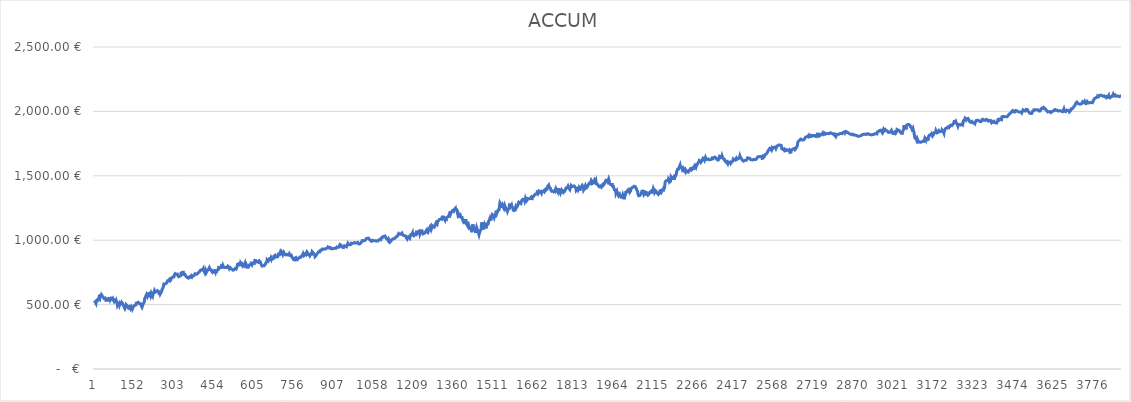
| Category | ACCUM |
|---|---|
| 0 | 512.623 |
| 1 | 507.414 |
| 2 | 518.309 |
| 3 | 517.795 |
| 4 | 521.968 |
| 5 | 520.018 |
| 6 | 518.518 |
| 7 | 510.027 |
| 8 | 525.175 |
| 9 | 525.111 |
| 10 | 529.126 |
| 11 | 526.892 |
| 12 | 528.816 |
| 13 | 539.458 |
| 14 | 543.008 |
| 15 | 540.229 |
| 16 | 535.636 |
| 17 | 545.15 |
| 18 | 553.718 |
| 19 | 550.766 |
| 20 | 550.173 |
| 21 | 544.728 |
| 22 | 558.929 |
| 23 | 569.485 |
| 24 | 567.345 |
| 25 | 564.527 |
| 26 | 570.089 |
| 27 | 568.044 |
| 28 | 575.996 |
| 29 | 578.267 |
| 30 | 574.96 |
| 31 | 567.061 |
| 32 | 567.061 |
| 33 | 558.145 |
| 34 | 558.145 |
| 35 | 556.226 |
| 36 | 558.119 |
| 37 | 548.35 |
| 38 | 547.646 |
| 39 | 554.257 |
| 40 | 550.28 |
| 41 | 551.643 |
| 42 | 548.171 |
| 43 | 548.067 |
| 44 | 535.537 |
| 45 | 535.898 |
| 46 | 538.533 |
| 47 | 534.886 |
| 48 | 541.489 |
| 49 | 540.502 |
| 50 | 533.486 |
| 51 | 535.482 |
| 52 | 535.482 |
| 53 | 541.248 |
| 54 | 534.462 |
| 55 | 535.218 |
| 56 | 547.186 |
| 57 | 546.317 |
| 58 | 549.156 |
| 59 | 548.011 |
| 60 | 545.422 |
| 61 | 536.616 |
| 62 | 544.181 |
| 63 | 542.673 |
| 64 | 548.645 |
| 65 | 546.04 |
| 66 | 541.968 |
| 67 | 545.493 |
| 68 | 540.734 |
| 69 | 545.941 |
| 70 | 545.781 |
| 71 | 549.038 |
| 72 | 544.098 |
| 73 | 544.555 |
| 74 | 536.411 |
| 75 | 536.749 |
| 76 | 535.446 |
| 77 | 520.162 |
| 78 | 523.254 |
| 79 | 524.823 |
| 80 | 523.496 |
| 81 | 526.225 |
| 82 | 526.185 |
| 83 | 534.342 |
| 84 | 532.463 |
| 85 | 520.161 |
| 86 | 516.949 |
| 87 | 509.176 |
| 88 | 496.117 |
| 89 | 493.244 |
| 90 | 505.654 |
| 91 | 506.544 |
| 92 | 506.677 |
| 93 | 513.375 |
| 94 | 513.215 |
| 95 | 504.811 |
| 96 | 496.115 |
| 97 | 497.984 |
| 98 | 507.861 |
| 99 | 505.895 |
| 100 | 504.679 |
| 101 | 508.891 |
| 102 | 508.74 |
| 103 | 506.696 |
| 104 | 518.08 |
| 105 | 513.447 |
| 106 | 518.109 |
| 107 | 516.238 |
| 108 | 507.534 |
| 109 | 495.904 |
| 110 | 491.737 |
| 111 | 495.483 |
| 112 | 490.669 |
| 113 | 486.4 |
| 114 | 478.122 |
| 115 | 476.353 |
| 116 | 469.291 |
| 117 | 472.88 |
| 118 | 480.626 |
| 119 | 486.243 |
| 120 | 488.917 |
| 121 | 499.859 |
| 122 | 500.3 |
| 123 | 499.699 |
| 124 | 497.157 |
| 125 | 491.176 |
| 126 | 490.362 |
| 127 | 487.355 |
| 128 | 484.426 |
| 129 | 474.736 |
| 130 | 471.895 |
| 131 | 476.178 |
| 132 | 474.141 |
| 133 | 482.898 |
| 134 | 480.869 |
| 135 | 484.008 |
| 136 | 475.533 |
| 137 | 467.674 |
| 138 | 464.256 |
| 139 | 464.096 |
| 140 | 481.54 |
| 141 | 473.98 |
| 142 | 473.98 |
| 143 | 474.019 |
| 144 | 462.94 |
| 145 | 461.432 |
| 146 | 473.092 |
| 147 | 475.624 |
| 148 | 482.25 |
| 149 | 482.77 |
| 150 | 490.43 |
| 151 | 490.27 |
| 152 | 488.257 |
| 153 | 494.718 |
| 154 | 494.558 |
| 155 | 497.397 |
| 156 | 493.924 |
| 157 | 494.05 |
| 158 | 498.175 |
| 159 | 511.855 |
| 160 | 512.88 |
| 161 | 519.159 |
| 162 | 517.959 |
| 163 | 514.005 |
| 164 | 514.548 |
| 165 | 514.223 |
| 166 | 518.144 |
| 167 | 517.574 |
| 168 | 515.625 |
| 169 | 515.625 |
| 170 | 511.031 |
| 171 | 507.638 |
| 172 | 507.478 |
| 173 | 504.352 |
| 174 | 511.46 |
| 175 | 507.356 |
| 176 | 507.196 |
| 177 | 496.504 |
| 178 | 500.259 |
| 179 | 491.855 |
| 180 | 489.873 |
| 181 | 479.749 |
| 182 | 485.066 |
| 183 | 485.066 |
| 184 | 486.501 |
| 185 | 504.465 |
| 186 | 509.427 |
| 187 | 509.267 |
| 188 | 509.107 |
| 189 | 518.187 |
| 190 | 532.435 |
| 191 | 546.352 |
| 192 | 551.156 |
| 193 | 556.481 |
| 194 | 556.321 |
| 195 | 565.306 |
| 196 | 565.889 |
| 197 | 566.685 |
| 198 | 578.795 |
| 199 | 571.685 |
| 200 | 569.435 |
| 201 | 582.082 |
| 202 | 584.061 |
| 203 | 578.016 |
| 204 | 579.854 |
| 205 | 585.241 |
| 206 | 572.963 |
| 207 | 570.974 |
| 208 | 556.747 |
| 209 | 554.498 |
| 210 | 564.383 |
| 211 | 578.891 |
| 212 | 583.671 |
| 213 | 587.742 |
| 214 | 585.35 |
| 215 | 566.231 |
| 216 | 567.122 |
| 217 | 567.002 |
| 218 | 579.996 |
| 219 | 581.147 |
| 220 | 574.913 |
| 221 | 566.777 |
| 222 | 576.828 |
| 223 | 587.289 |
| 224 | 592.834 |
| 225 | 592.674 |
| 226 | 589.494 |
| 227 | 601.43 |
| 228 | 609.303 |
| 229 | 613.318 |
| 230 | 613.522 |
| 231 | 597.212 |
| 232 | 597.819 |
| 233 | 597.833 |
| 234 | 601.383 |
| 235 | 602.36 |
| 236 | 613.389 |
| 237 | 609.467 |
| 238 | 591.263 |
| 239 | 598.498 |
| 240 | 606.45 |
| 241 | 601.509 |
| 242 | 601.349 |
| 243 | 601.766 |
| 244 | 600.684 |
| 245 | 590.268 |
| 246 | 591.719 |
| 247 | 593.762 |
| 248 | 594.518 |
| 249 | 596.134 |
| 250 | 583.998 |
| 251 | 585.843 |
| 252 | 590.979 |
| 253 | 595.396 |
| 254 | 599.001 |
| 255 | 603.789 |
| 256 | 610.021 |
| 257 | 620.008 |
| 258 | 621.609 |
| 259 | 618.641 |
| 260 | 630.665 |
| 261 | 636.818 |
| 262 | 643.981 |
| 263 | 659.823 |
| 264 | 661.321 |
| 265 | 662.827 |
| 266 | 665.121 |
| 267 | 659.258 |
| 268 | 664.638 |
| 269 | 653.441 |
| 270 | 659.081 |
| 271 | 663.822 |
| 272 | 660.349 |
| 273 | 662.037 |
| 274 | 663.558 |
| 275 | 671.897 |
| 276 | 672.29 |
| 277 | 684.771 |
| 278 | 688.131 |
| 279 | 684.501 |
| 280 | 689.336 |
| 281 | 686.692 |
| 282 | 687.961 |
| 283 | 692.394 |
| 284 | 694.705 |
| 285 | 690.569 |
| 286 | 690.569 |
| 287 | 685.621 |
| 288 | 685.461 |
| 289 | 685.461 |
| 290 | 693.855 |
| 291 | 705.555 |
| 292 | 701.94 |
| 293 | 708.567 |
| 294 | 709.875 |
| 295 | 709.748 |
| 296 | 708.469 |
| 297 | 714.709 |
| 298 | 713.997 |
| 299 | 714.825 |
| 300 | 706.894 |
| 301 | 715.911 |
| 302 | 718.774 |
| 303 | 731.303 |
| 304 | 733.795 |
| 305 | 733.407 |
| 306 | 740.712 |
| 307 | 739.472 |
| 308 | 741.933 |
| 309 | 741.798 |
| 310 | 735.445 |
| 311 | 730.749 |
| 312 | 728.713 |
| 313 | 736.625 |
| 314 | 736.625 |
| 315 | 728.237 |
| 316 | 733.207 |
| 317 | 733.207 |
| 318 | 720.613 |
| 319 | 716.825 |
| 320 | 723.081 |
| 321 | 723.032 |
| 322 | 722.368 |
| 323 | 720.647 |
| 324 | 720.946 |
| 325 | 724.061 |
| 326 | 724.171 |
| 327 | 724.406 |
| 328 | 742.189 |
| 329 | 741.083 |
| 330 | 738.526 |
| 331 | 737.247 |
| 332 | 740.22 |
| 333 | 749.813 |
| 334 | 750.341 |
| 335 | 750.056 |
| 336 | 748.492 |
| 337 | 751.04 |
| 338 | 747.496 |
| 339 | 734.09 |
| 340 | 738.854 |
| 341 | 739.145 |
| 342 | 740.856 |
| 343 | 733.841 |
| 344 | 736.791 |
| 345 | 725.791 |
| 346 | 726.208 |
| 347 | 725.26 |
| 348 | 716.154 |
| 349 | 715.679 |
| 350 | 719.166 |
| 351 | 713.223 |
| 352 | 710.271 |
| 353 | 714.176 |
| 354 | 714.016 |
| 355 | 713.336 |
| 356 | 705.477 |
| 357 | 702.817 |
| 358 | 703.478 |
| 359 | 703.383 |
| 360 | 716.061 |
| 361 | 710.608 |
| 362 | 710.608 |
| 363 | 711.159 |
| 364 | 712.286 |
| 365 | 714.967 |
| 366 | 715.566 |
| 367 | 723.652 |
| 368 | 725.111 |
| 369 | 716.841 |
| 370 | 714.938 |
| 371 | 713.154 |
| 372 | 713.461 |
| 373 | 723.361 |
| 374 | 725.467 |
| 375 | 720.819 |
| 376 | 722.766 |
| 377 | 725.708 |
| 378 | 732.453 |
| 379 | 730.961 |
| 380 | 732.609 |
| 381 | 739.03 |
| 382 | 736.496 |
| 383 | 741.86 |
| 384 | 732.936 |
| 385 | 736.028 |
| 386 | 739.979 |
| 387 | 737.209 |
| 388 | 741.445 |
| 389 | 737.364 |
| 390 | 737.923 |
| 391 | 743.998 |
| 392 | 740.233 |
| 393 | 747.404 |
| 394 | 751.427 |
| 395 | 752.751 |
| 396 | 751.732 |
| 397 | 752.804 |
| 398 | 757.971 |
| 399 | 759.95 |
| 400 | 760.352 |
| 401 | 766.631 |
| 402 | 772.429 |
| 403 | 767.552 |
| 404 | 766.707 |
| 405 | 769.759 |
| 406 | 777.198 |
| 407 | 770.546 |
| 408 | 767.925 |
| 409 | 768.595 |
| 410 | 768.381 |
| 411 | 773.2 |
| 412 | 778.967 |
| 413 | 764.582 |
| 414 | 761.543 |
| 415 | 762.379 |
| 416 | 755.616 |
| 417 | 757.824 |
| 418 | 750.959 |
| 419 | 741.734 |
| 420 | 742.94 |
| 421 | 750.269 |
| 422 | 762.182 |
| 423 | 757.036 |
| 424 | 751.844 |
| 425 | 753.547 |
| 426 | 754.895 |
| 427 | 764.614 |
| 428 | 763.153 |
| 429 | 769.835 |
| 430 | 770.718 |
| 431 | 770.259 |
| 432 | 772.309 |
| 433 | 765.862 |
| 434 | 772.449 |
| 435 | 787.186 |
| 436 | 788.448 |
| 437 | 781.227 |
| 438 | 771.782 |
| 439 | 770.7 |
| 440 | 773.16 |
| 441 | 773 |
| 442 | 770.325 |
| 443 | 761.345 |
| 444 | 758.495 |
| 445 | 754.849 |
| 446 | 754.169 |
| 447 | 750.302 |
| 448 | 756.29 |
| 449 | 754.608 |
| 450 | 754.448 |
| 451 | 762.092 |
| 452 | 764.245 |
| 453 | 763.376 |
| 454 | 763.809 |
| 455 | 764.242 |
| 456 | 762.647 |
| 457 | 758.44 |
| 458 | 749.973 |
| 459 | 758.02 |
| 460 | 757.593 |
| 461 | 760.772 |
| 462 | 755.476 |
| 463 | 756.169 |
| 464 | 763.893 |
| 465 | 767.568 |
| 466 | 767.465 |
| 467 | 770.47 |
| 468 | 770.208 |
| 469 | 771.99 |
| 470 | 787.043 |
| 471 | 783.476 |
| 472 | 781.81 |
| 473 | 785.43 |
| 474 | 784.072 |
| 475 | 780.852 |
| 476 | 777.143 |
| 477 | 777.143 |
| 478 | 786.988 |
| 479 | 789.054 |
| 480 | 799.184 |
| 481 | 795.372 |
| 482 | 797.28 |
| 483 | 800.143 |
| 484 | 792.836 |
| 485 | 797.798 |
| 486 | 806.302 |
| 487 | 809.536 |
| 488 | 805.243 |
| 489 | 792.783 |
| 490 | 798.242 |
| 491 | 790.256 |
| 492 | 786.271 |
| 493 | 787.642 |
| 494 | 782.473 |
| 495 | 784.595 |
| 496 | 784.435 |
| 497 | 788.173 |
| 498 | 792.157 |
| 499 | 787.351 |
| 500 | 789.44 |
| 501 | 789.124 |
| 502 | 788.018 |
| 503 | 794.384 |
| 504 | 797.728 |
| 505 | 801.294 |
| 506 | 800.764 |
| 507 | 792.612 |
| 508 | 783.553 |
| 509 | 792.287 |
| 510 | 788.995 |
| 511 | 790.967 |
| 512 | 788.015 |
| 513 | 789.363 |
| 514 | 784.841 |
| 515 | 783.128 |
| 516 | 778.803 |
| 517 | 776.151 |
| 518 | 774.398 |
| 519 | 774.168 |
| 520 | 774.964 |
| 521 | 781.062 |
| 522 | 779.877 |
| 523 | 768.948 |
| 524 | 767.219 |
| 525 | 769.988 |
| 526 | 774.847 |
| 527 | 765.157 |
| 528 | 769.842 |
| 529 | 771.325 |
| 530 | 771.165 |
| 531 | 776.994 |
| 532 | 779.486 |
| 533 | 772.708 |
| 534 | 774.719 |
| 535 | 774.559 |
| 536 | 776.041 |
| 537 | 775.881 |
| 538 | 781.639 |
| 539 | 789.655 |
| 540 | 803.051 |
| 541 | 812.265 |
| 542 | 812.265 |
| 543 | 814.41 |
| 544 | 816.91 |
| 545 | 816.75 |
| 546 | 816.59 |
| 547 | 816.502 |
| 548 | 807.909 |
| 549 | 807.908 |
| 550 | 801.879 |
| 551 | 808.702 |
| 552 | 808.615 |
| 553 | 822.326 |
| 554 | 815.272 |
| 555 | 815.272 |
| 556 | 811.239 |
| 557 | 804.31 |
| 558 | 808.933 |
| 559 | 802.856 |
| 560 | 811.329 |
| 561 | 811.329 |
| 562 | 814.271 |
| 563 | 802.537 |
| 564 | 806.308 |
| 565 | 807.135 |
| 566 | 809.083 |
| 567 | 810.809 |
| 568 | 812.363 |
| 569 | 820.315 |
| 570 | 806.419 |
| 571 | 795.065 |
| 572 | 795.671 |
| 573 | 792.04 |
| 574 | 794.004 |
| 575 | 792.717 |
| 576 | 800.858 |
| 577 | 798.048 |
| 578 | 789.778 |
| 579 | 789.778 |
| 580 | 786.124 |
| 581 | 790.565 |
| 582 | 790.405 |
| 583 | 790.245 |
| 584 | 794.812 |
| 585 | 795.979 |
| 586 | 807.403 |
| 587 | 811.386 |
| 588 | 809.578 |
| 589 | 808.583 |
| 590 | 810.389 |
| 591 | 811.066 |
| 592 | 818.371 |
| 593 | 820.824 |
| 594 | 815.221 |
| 595 | 814.88 |
| 596 | 807.21 |
| 597 | 814.35 |
| 598 | 816.139 |
| 599 | 821.488 |
| 600 | 820.769 |
| 601 | 824.35 |
| 602 | 826.739 |
| 603 | 826.131 |
| 604 | 822.035 |
| 605 | 820.929 |
| 606 | 830.64 |
| 607 | 843.366 |
| 608 | 846 |
| 609 | 847.443 |
| 610 | 841.564 |
| 611 | 841.564 |
| 612 | 839.985 |
| 613 | 840.907 |
| 614 | 831.579 |
| 615 | 832.588 |
| 616 | 834.426 |
| 617 | 829.856 |
| 618 | 831.252 |
| 619 | 823.692 |
| 620 | 825.529 |
| 621 | 833.805 |
| 622 | 837.969 |
| 623 | 828.942 |
| 624 | 825.809 |
| 625 | 829.784 |
| 626 | 831.495 |
| 627 | 831.518 |
| 628 | 831.288 |
| 629 | 819.886 |
| 630 | 819.151 |
| 631 | 823.442 |
| 632 | 807.18 |
| 633 | 803.699 |
| 634 | 799.398 |
| 635 | 793.676 |
| 636 | 796.303 |
| 637 | 796.759 |
| 638 | 800.853 |
| 639 | 800.693 |
| 640 | 795.934 |
| 641 | 798.924 |
| 642 | 801.668 |
| 643 | 796.554 |
| 644 | 799.394 |
| 645 | 808.663 |
| 646 | 811.226 |
| 647 | 817.159 |
| 648 | 822.712 |
| 649 | 822.712 |
| 650 | 822.712 |
| 651 | 826.79 |
| 652 | 836.896 |
| 653 | 847.247 |
| 654 | 847.411 |
| 655 | 845.217 |
| 656 | 844.001 |
| 657 | 837.38 |
| 658 | 841.126 |
| 659 | 843.981 |
| 660 | 846.568 |
| 661 | 850.56 |
| 662 | 857.162 |
| 663 | 855.276 |
| 664 | 855.116 |
| 665 | 862.192 |
| 666 | 861.567 |
| 667 | 858.347 |
| 668 | 853.281 |
| 669 | 863.955 |
| 670 | 858.044 |
| 671 | 858.044 |
| 672 | 854.027 |
| 673 | 852.416 |
| 674 | 859.153 |
| 675 | 859.673 |
| 676 | 855.096 |
| 677 | 862.598 |
| 678 | 862.889 |
| 679 | 876.553 |
| 680 | 875.487 |
| 681 | 879.809 |
| 682 | 879.649 |
| 683 | 882.378 |
| 684 | 880.989 |
| 685 | 869.168 |
| 686 | 870.706 |
| 687 | 873.079 |
| 688 | 873.094 |
| 689 | 871.223 |
| 690 | 869.715 |
| 691 | 870.085 |
| 692 | 870.62 |
| 693 | 871.25 |
| 694 | 871.123 |
| 695 | 884.409 |
| 696 | 892.266 |
| 697 | 893.117 |
| 698 | 896.319 |
| 699 | 891.166 |
| 700 | 889.208 |
| 701 | 893.98 |
| 702 | 901.214 |
| 703 | 892.747 |
| 704 | 894.387 |
| 705 | 892.927 |
| 706 | 893.423 |
| 707 | 892.317 |
| 708 | 895.377 |
| 709 | 908.434 |
| 710 | 906.303 |
| 711 | 903.059 |
| 712 | 900.209 |
| 713 | 891.229 |
| 714 | 892.459 |
| 715 | 897.397 |
| 716 | 904.521 |
| 717 | 902.31 |
| 718 | 896.85 |
| 719 | 891.262 |
| 720 | 892.524 |
| 721 | 891.063 |
| 722 | 892.222 |
| 723 | 885.995 |
| 724 | 885.702 |
| 725 | 887.129 |
| 726 | 889.274 |
| 727 | 890.417 |
| 728 | 887.694 |
| 729 | 887.188 |
| 730 | 885.206 |
| 731 | 885.158 |
| 732 | 885.551 |
| 733 | 882.213 |
| 734 | 879.979 |
| 735 | 886.029 |
| 736 | 885.602 |
| 737 | 894.809 |
| 738 | 895.178 |
| 739 | 892.653 |
| 740 | 882.316 |
| 741 | 879.166 |
| 742 | 880.499 |
| 743 | 880.363 |
| 744 | 884.063 |
| 745 | 880.085 |
| 746 | 875.397 |
| 747 | 866.473 |
| 748 | 865.864 |
| 749 | 864.514 |
| 750 | 858.785 |
| 751 | 859.888 |
| 752 | 851.342 |
| 753 | 845.818 |
| 754 | 847.403 |
| 755 | 846.108 |
| 756 | 847.882 |
| 757 | 859.274 |
| 758 | 855.146 |
| 759 | 857.22 |
| 760 | 866.624 |
| 761 | 863.909 |
| 762 | 859.166 |
| 763 | 848.726 |
| 764 | 847.218 |
| 765 | 850.247 |
| 766 | 847.508 |
| 767 | 848.17 |
| 768 | 848.334 |
| 769 | 858.756 |
| 770 | 866.171 |
| 771 | 863.188 |
| 772 | 858.058 |
| 773 | 860.519 |
| 774 | 863.334 |
| 775 | 866.529 |
| 776 | 868.358 |
| 777 | 875.008 |
| 778 | 866.557 |
| 779 | 869.68 |
| 780 | 866.933 |
| 781 | 868.684 |
| 782 | 873.685 |
| 783 | 876.627 |
| 784 | 875.34 |
| 785 | 879.655 |
| 786 | 881.721 |
| 787 | 886.367 |
| 788 | 886.207 |
| 789 | 896.423 |
| 790 | 890.828 |
| 791 | 890.668 |
| 792 | 882.027 |
| 793 | 887.147 |
| 794 | 887.147 |
| 795 | 890.909 |
| 796 | 886.064 |
| 797 | 890.102 |
| 798 | 885.178 |
| 799 | 886.352 |
| 800 | 896.19 |
| 801 | 900.773 |
| 802 | 900.314 |
| 803 | 909.418 |
| 804 | 909.796 |
| 805 | 903.996 |
| 806 | 900.373 |
| 807 | 889.65 |
| 808 | 890.374 |
| 809 | 886.42 |
| 810 | 882.735 |
| 811 | 887.823 |
| 812 | 884.302 |
| 813 | 884.142 |
| 814 | 878.831 |
| 815 | 879.58 |
| 816 | 886.293 |
| 817 | 892.352 |
| 818 | 886.867 |
| 819 | 893.422 |
| 820 | 893.185 |
| 821 | 891.684 |
| 822 | 900.788 |
| 823 | 911.313 |
| 824 | 912.755 |
| 825 | 912.36 |
| 826 | 906.607 |
| 827 | 901.903 |
| 828 | 901.743 |
| 829 | 895.351 |
| 830 | 891.579 |
| 831 | 885.976 |
| 832 | 885.976 |
| 833 | 882.913 |
| 834 | 872.774 |
| 835 | 873.222 |
| 836 | 879.746 |
| 837 | 876.384 |
| 838 | 881.709 |
| 839 | 887.144 |
| 840 | 883.024 |
| 841 | 893.879 |
| 842 | 892.19 |
| 843 | 897.404 |
| 844 | 896.78 |
| 845 | 901.663 |
| 846 | 904.32 |
| 847 | 905.945 |
| 848 | 911.474 |
| 849 | 913.959 |
| 850 | 913.492 |
| 851 | 915.613 |
| 852 | 910.002 |
| 853 | 915.485 |
| 854 | 916.525 |
| 855 | 922.465 |
| 856 | 917.77 |
| 857 | 917.61 |
| 858 | 917.908 |
| 859 | 923.202 |
| 860 | 930.025 |
| 861 | 930.987 |
| 862 | 929.408 |
| 863 | 928.428 |
| 864 | 930.218 |
| 865 | 930.058 |
| 866 | 929.071 |
| 867 | 927.444 |
| 868 | 929.684 |
| 869 | 932.515 |
| 870 | 932.355 |
| 871 | 932.922 |
| 872 | 927.406 |
| 873 | 931.476 |
| 874 | 931.476 |
| 875 | 932.619 |
| 876 | 934.023 |
| 877 | 936.949 |
| 878 | 941.058 |
| 879 | 936.623 |
| 880 | 938.476 |
| 881 | 939.232 |
| 882 | 946.892 |
| 883 | 947.562 |
| 884 | 945.218 |
| 885 | 941.027 |
| 886 | 941.988 |
| 887 | 942.042 |
| 888 | 939.919 |
| 889 | 944.739 |
| 890 | 944.856 |
| 891 | 943.711 |
| 892 | 942.289 |
| 893 | 935.187 |
| 894 | 934.95 |
| 895 | 930.838 |
| 896 | 929.369 |
| 897 | 932.777 |
| 898 | 935.49 |
| 899 | 936.893 |
| 900 | 935.732 |
| 901 | 935.572 |
| 902 | 942.656 |
| 903 | 942.292 |
| 904 | 937.052 |
| 905 | 936.23 |
| 906 | 940.277 |
| 907 | 932.757 |
| 908 | 936.842 |
| 909 | 937.544 |
| 910 | 940.383 |
| 911 | 940.223 |
| 912 | 941.973 |
| 913 | 937.088 |
| 914 | 936.764 |
| 915 | 941.007 |
| 916 | 942.087 |
| 917 | 947.601 |
| 918 | 946.638 |
| 919 | 943.433 |
| 920 | 943.779 |
| 921 | 945.127 |
| 922 | 942.578 |
| 923 | 945.07 |
| 924 | 944.91 |
| 925 | 946.913 |
| 926 | 954.762 |
| 927 | 954.777 |
| 928 | 966.437 |
| 929 | 963.919 |
| 930 | 968.889 |
| 931 | 968.729 |
| 932 | 961.714 |
| 933 | 954.209 |
| 934 | 953.364 |
| 935 | 951.272 |
| 936 | 951.272 |
| 937 | 951.239 |
| 938 | 944.374 |
| 939 | 939.741 |
| 940 | 943.464 |
| 941 | 937.798 |
| 942 | 943.233 |
| 943 | 948.053 |
| 944 | 949.204 |
| 945 | 956.927 |
| 946 | 958.78 |
| 947 | 958.897 |
| 948 | 955.006 |
| 949 | 955.676 |
| 950 | 952.471 |
| 951 | 953.638 |
| 952 | 953.478 |
| 953 | 949.658 |
| 954 | 949.658 |
| 955 | 955.188 |
| 956 | 963.132 |
| 957 | 969.972 |
| 958 | 976.267 |
| 959 | 975.445 |
| 960 | 973.582 |
| 961 | 968.342 |
| 962 | 964.546 |
| 963 | 966.809 |
| 964 | 965.735 |
| 965 | 964.251 |
| 966 | 965.678 |
| 967 | 967.444 |
| 968 | 967.284 |
| 969 | 966.265 |
| 970 | 972.229 |
| 971 | 976.52 |
| 972 | 973.37 |
| 973 | 972.217 |
| 974 | 975.128 |
| 975 | 974.054 |
| 976 | 978.81 |
| 977 | 979.519 |
| 978 | 974.468 |
| 979 | 977.268 |
| 980 | 981.678 |
| 981 | 979.751 |
| 982 | 981.936 |
| 983 | 981.776 |
| 984 | 979.558 |
| 985 | 985.277 |
| 986 | 977.891 |
| 987 | 978.379 |
| 988 | 978.133 |
| 989 | 979.442 |
| 990 | 978.123 |
| 991 | 978.13 |
| 992 | 976.985 |
| 993 | 980.045 |
| 994 | 978.411 |
| 995 | 982.662 |
| 996 | 983.781 |
| 997 | 980.277 |
| 998 | 979.747 |
| 999 | 971.17 |
| 1000 | 968.021 |
| 1001 | 967.861 |
| 1002 | 971.434 |
| 1003 | 971.434 |
| 1004 | 976.372 |
| 1005 | 975.511 |
| 1006 | 977.884 |
| 1007 | 979.083 |
| 1008 | 985.378 |
| 1009 | 986.016 |
| 1010 | 987.482 |
| 1011 | 992.98 |
| 1012 | 997.169 |
| 1013 | 997.169 |
| 1014 | 1000.852 |
| 1015 | 999.123 |
| 1016 | 996.179 |
| 1017 | 996.179 |
| 1018 | 998.537 |
| 1019 | 997.96 |
| 1020 | 995.142 |
| 1021 | 995.142 |
| 1022 | 994.982 |
| 1023 | 998.887 |
| 1024 | 1000.464 |
| 1025 | 1007.09 |
| 1026 | 1007.602 |
| 1027 | 1011.467 |
| 1028 | 1007.781 |
| 1029 | 1009.279 |
| 1030 | 1011.724 |
| 1031 | 1014.879 |
| 1032 | 1014.719 |
| 1033 | 1012.824 |
| 1034 | 1011.048 |
| 1035 | 1016.018 |
| 1036 | 1016.095 |
| 1037 | 1013.096 |
| 1038 | 1008.834 |
| 1039 | 1007.516 |
| 1040 | 1003.98 |
| 1041 | 1004.847 |
| 1042 | 1001.477 |
| 1043 | 998.177 |
| 1044 | 998.263 |
| 1045 | 993.646 |
| 1046 | 994.868 |
| 1047 | 991.411 |
| 1048 | 994.385 |
| 1049 | 993.603 |
| 1050 | 993.443 |
| 1051 | 999.272 |
| 1052 | 1000.904 |
| 1053 | 1001.834 |
| 1054 | 998.219 |
| 1055 | 996.593 |
| 1056 | 997.381 |
| 1057 | 994.855 |
| 1058 | 995.603 |
| 1059 | 995.658 |
| 1060 | 995.498 |
| 1061 | 993.776 |
| 1062 | 995.598 |
| 1063 | 996.118 |
| 1064 | 999.762 |
| 1065 | 997.023 |
| 1066 | 998.513 |
| 1067 | 992.792 |
| 1068 | 997.469 |
| 1069 | 998.21 |
| 1070 | 993.735 |
| 1071 | 992.953 |
| 1072 | 992.889 |
| 1073 | 998.813 |
| 1074 | 1001.573 |
| 1075 | 1001.413 |
| 1076 | 999.432 |
| 1077 | 998.192 |
| 1078 | 1004.361 |
| 1079 | 1004.005 |
| 1080 | 1003.246 |
| 1081 | 1003.103 |
| 1082 | 1002.731 |
| 1083 | 1009.934 |
| 1084 | 1016.552 |
| 1085 | 1017.498 |
| 1086 | 1017.678 |
| 1087 | 1016.438 |
| 1088 | 1018.56 |
| 1089 | 1017.959 |
| 1090 | 1027.41 |
| 1091 | 1027.172 |
| 1092 | 1030.564 |
| 1093 | 1029.916 |
| 1094 | 1028.873 |
| 1095 | 1029.219 |
| 1096 | 1030.78 |
| 1097 | 1030.764 |
| 1098 | 1032.443 |
| 1099 | 1030.091 |
| 1100 | 1031.289 |
| 1101 | 1023.272 |
| 1102 | 1021.464 |
| 1103 | 1012.397 |
| 1104 | 1006.526 |
| 1105 | 1007.463 |
| 1106 | 1006.224 |
| 1107 | 1008.834 |
| 1108 | 1003.231 |
| 1109 | 1002.662 |
| 1110 | 998.108 |
| 1111 | 998.108 |
| 1112 | 1007.599 |
| 1113 | 1006.533 |
| 1114 | 1000.298 |
| 1115 | 994.277 |
| 1116 | 987.057 |
| 1117 | 985.691 |
| 1118 | 989.374 |
| 1119 | 989.523 |
| 1120 | 988.804 |
| 1121 | 994.736 |
| 1122 | 992.889 |
| 1123 | 1001.472 |
| 1124 | 1003.83 |
| 1125 | 1000.468 |
| 1126 | 1006.108 |
| 1127 | 1009.989 |
| 1128 | 1010.13 |
| 1129 | 1009.513 |
| 1130 | 1008.045 |
| 1131 | 1011.223 |
| 1132 | 1011.063 |
| 1133 | 1010.903 |
| 1134 | 1008.401 |
| 1135 | 1011.185 |
| 1136 | 1016.123 |
| 1137 | 1017.479 |
| 1138 | 1016.649 |
| 1139 | 1016.435 |
| 1140 | 1025.563 |
| 1141 | 1023.597 |
| 1142 | 1032.141 |
| 1143 | 1030.041 |
| 1144 | 1029.511 |
| 1145 | 1033.353 |
| 1146 | 1032.571 |
| 1147 | 1034.337 |
| 1148 | 1043.346 |
| 1149 | 1046.738 |
| 1150 | 1052.678 |
| 1151 | 1058.01 |
| 1152 | 1054.112 |
| 1153 | 1053.952 |
| 1154 | 1046.968 |
| 1155 | 1042.351 |
| 1156 | 1042.191 |
| 1157 | 1046.238 |
| 1158 | 1046.078 |
| 1159 | 1048.215 |
| 1160 | 1045.673 |
| 1161 | 1048.268 |
| 1162 | 1055.091 |
| 1163 | 1054.435 |
| 1164 | 1044.58 |
| 1165 | 1038.006 |
| 1166 | 1037.634 |
| 1167 | 1042.083 |
| 1168 | 1036.528 |
| 1169 | 1035.674 |
| 1170 | 1036.304 |
| 1171 | 1040.501 |
| 1172 | 1035.426 |
| 1173 | 1028.979 |
| 1174 | 1032.489 |
| 1175 | 1039.187 |
| 1176 | 1032.692 |
| 1177 | 1029.425 |
| 1178 | 1029.203 |
| 1179 | 1018.037 |
| 1180 | 1012.434 |
| 1181 | 1012.274 |
| 1182 | 1009.172 |
| 1183 | 1013.029 |
| 1184 | 1012.444 |
| 1185 | 1026.006 |
| 1186 | 1027.354 |
| 1187 | 1026.604 |
| 1188 | 1025.608 |
| 1189 | 1029.497 |
| 1190 | 1026.127 |
| 1191 | 1027.017 |
| 1192 | 1019.213 |
| 1193 | 1027.915 |
| 1194 | 1025.491 |
| 1195 | 1032.512 |
| 1196 | 1044.117 |
| 1197 | 1042.191 |
| 1198 | 1043.539 |
| 1199 | 1047.949 |
| 1200 | 1047.789 |
| 1201 | 1051.243 |
| 1202 | 1056.584 |
| 1203 | 1040.605 |
| 1204 | 1039.823 |
| 1205 | 1040.69 |
| 1206 | 1038.322 |
| 1207 | 1033.989 |
| 1208 | 1037.76 |
| 1209 | 1036.244 |
| 1210 | 1036.645 |
| 1211 | 1043.54 |
| 1212 | 1032.556 |
| 1213 | 1040.247 |
| 1214 | 1050.038 |
| 1215 | 1049.831 |
| 1216 | 1059.188 |
| 1217 | 1056.086 |
| 1218 | 1055.335 |
| 1219 | 1051.121 |
| 1220 | 1051.94 |
| 1221 | 1047.986 |
| 1222 | 1059.339 |
| 1223 | 1061.579 |
| 1224 | 1068.15 |
| 1225 | 1073.198 |
| 1226 | 1073.198 |
| 1227 | 1074.049 |
| 1228 | 1072.257 |
| 1229 | 1060.311 |
| 1230 | 1046.605 |
| 1231 | 1046.619 |
| 1232 | 1056.37 |
| 1233 | 1061.971 |
| 1234 | 1069.797 |
| 1235 | 1070.119 |
| 1236 | 1076.762 |
| 1237 | 1076.839 |
| 1238 | 1072.175 |
| 1239 | 1073.957 |
| 1240 | 1059.525 |
| 1241 | 1060.968 |
| 1242 | 1049.235 |
| 1243 | 1047.521 |
| 1244 | 1047.741 |
| 1245 | 1052.853 |
| 1246 | 1052.693 |
| 1247 | 1058.033 |
| 1248 | 1054.868 |
| 1249 | 1054.708 |
| 1250 | 1059.915 |
| 1251 | 1060.679 |
| 1252 | 1068.315 |
| 1253 | 1067.312 |
| 1254 | 1066.459 |
| 1255 | 1077.89 |
| 1256 | 1066.165 |
| 1257 | 1060.278 |
| 1258 | 1058.904 |
| 1259 | 1058.904 |
| 1260 | 1060.047 |
| 1261 | 1063.825 |
| 1262 | 1072.929 |
| 1263 | 1074.869 |
| 1264 | 1074.869 |
| 1265 | 1074.465 |
| 1266 | 1091.081 |
| 1267 | 1097.833 |
| 1268 | 1100.744 |
| 1269 | 1104.908 |
| 1270 | 1096.607 |
| 1271 | 1096.48 |
| 1272 | 1080.801 |
| 1273 | 1080.611 |
| 1274 | 1079.402 |
| 1275 | 1097.256 |
| 1276 | 1112.664 |
| 1277 | 1117.808 |
| 1278 | 1118.88 |
| 1279 | 1118.105 |
| 1280 | 1104.415 |
| 1281 | 1098.749 |
| 1282 | 1098.598 |
| 1283 | 1102.542 |
| 1284 | 1100.829 |
| 1285 | 1100.93 |
| 1286 | 1110.326 |
| 1287 | 1117.292 |
| 1288 | 1122.403 |
| 1289 | 1126.024 |
| 1290 | 1122.772 |
| 1291 | 1135.253 |
| 1292 | 1138.321 |
| 1293 | 1130.848 |
| 1294 | 1130.848 |
| 1295 | 1124.495 |
| 1296 | 1132.724 |
| 1297 | 1149.055 |
| 1298 | 1153.157 |
| 1299 | 1155.483 |
| 1300 | 1148.452 |
| 1301 | 1152.159 |
| 1302 | 1151.999 |
| 1303 | 1155.833 |
| 1304 | 1161.094 |
| 1305 | 1158.189 |
| 1306 | 1158.029 |
| 1307 | 1158.029 |
| 1308 | 1164.719 |
| 1309 | 1159.298 |
| 1310 | 1165.53 |
| 1311 | 1165.308 |
| 1312 | 1163.129 |
| 1313 | 1173.251 |
| 1314 | 1178.701 |
| 1315 | 1189.352 |
| 1316 | 1177.752 |
| 1317 | 1182.533 |
| 1318 | 1184.63 |
| 1319 | 1184.748 |
| 1320 | 1178.348 |
| 1321 | 1174.102 |
| 1322 | 1164.491 |
| 1323 | 1161.886 |
| 1324 | 1160.496 |
| 1325 | 1153.078 |
| 1326 | 1152.351 |
| 1327 | 1164.422 |
| 1328 | 1149.746 |
| 1329 | 1160.641 |
| 1330 | 1174.62 |
| 1331 | 1167.968 |
| 1332 | 1176.843 |
| 1333 | 1172.14 |
| 1334 | 1179.437 |
| 1335 | 1176.674 |
| 1336 | 1178.748 |
| 1337 | 1176.285 |
| 1338 | 1184.119 |
| 1339 | 1191.89 |
| 1340 | 1195.81 |
| 1341 | 1203.423 |
| 1342 | 1195.989 |
| 1343 | 1195.829 |
| 1344 | 1193.69 |
| 1345 | 1196.513 |
| 1346 | 1203.645 |
| 1347 | 1217.712 |
| 1348 | 1217.458 |
| 1349 | 1219.319 |
| 1350 | 1214.86 |
| 1351 | 1220.65 |
| 1352 | 1216.988 |
| 1353 | 1228.956 |
| 1354 | 1232.427 |
| 1355 | 1232.828 |
| 1356 | 1226.27 |
| 1357 | 1223.334 |
| 1358 | 1222.078 |
| 1359 | 1228.026 |
| 1360 | 1238.669 |
| 1361 | 1245.288 |
| 1362 | 1243.63 |
| 1363 | 1245.672 |
| 1364 | 1248.409 |
| 1365 | 1236.21 |
| 1366 | 1237.274 |
| 1367 | 1239.095 |
| 1368 | 1235.757 |
| 1369 | 1236.339 |
| 1370 | 1226.681 |
| 1371 | 1230.222 |
| 1372 | 1223.539 |
| 1373 | 1198.447 |
| 1374 | 1205.587 |
| 1375 | 1206.879 |
| 1376 | 1207.265 |
| 1377 | 1199.816 |
| 1378 | 1188.682 |
| 1379 | 1188.168 |
| 1380 | 1181.8 |
| 1381 | 1184.252 |
| 1382 | 1196.031 |
| 1383 | 1187.469 |
| 1384 | 1185.259 |
| 1385 | 1177.178 |
| 1386 | 1182.542 |
| 1387 | 1184.246 |
| 1388 | 1181.641 |
| 1389 | 1176.787 |
| 1390 | 1168.849 |
| 1391 | 1167.025 |
| 1392 | 1153.359 |
| 1393 | 1157.784 |
| 1394 | 1146.705 |
| 1395 | 1146.349 |
| 1396 | 1135.712 |
| 1397 | 1135.712 |
| 1398 | 1135.552 |
| 1399 | 1136.766 |
| 1400 | 1136.606 |
| 1401 | 1152.969 |
| 1402 | 1153.638 |
| 1403 | 1162.94 |
| 1404 | 1138.882 |
| 1405 | 1128.955 |
| 1406 | 1126.863 |
| 1407 | 1125.797 |
| 1408 | 1125.875 |
| 1409 | 1114.236 |
| 1410 | 1140.801 |
| 1411 | 1147.159 |
| 1412 | 1132.167 |
| 1413 | 1132.167 |
| 1414 | 1118.626 |
| 1415 | 1111.524 |
| 1416 | 1106.458 |
| 1417 | 1106.298 |
| 1418 | 1091.329 |
| 1419 | 1092.038 |
| 1420 | 1088.637 |
| 1421 | 1097.977 |
| 1422 | 1094.449 |
| 1423 | 1090.685 |
| 1424 | 1084.245 |
| 1425 | 1062.168 |
| 1426 | 1078.665 |
| 1427 | 1078.665 |
| 1428 | 1103.241 |
| 1429 | 1108.234 |
| 1430 | 1123.224 |
| 1431 | 1101.313 |
| 1432 | 1097.919 |
| 1433 | 1082.887 |
| 1434 | 1074.641 |
| 1435 | 1101.308 |
| 1436 | 1099.138 |
| 1437 | 1079.964 |
| 1438 | 1080.239 |
| 1439 | 1074.754 |
| 1440 | 1056.882 |
| 1441 | 1055.5 |
| 1442 | 1076.171 |
| 1443 | 1089.228 |
| 1444 | 1098.561 |
| 1445 | 1095.956 |
| 1446 | 1085.658 |
| 1447 | 1082.856 |
| 1448 | 1093.309 |
| 1449 | 1064.115 |
| 1450 | 1072.754 |
| 1451 | 1058.077 |
| 1452 | 1060.049 |
| 1453 | 1043.045 |
| 1454 | 1050.878 |
| 1455 | 1058.925 |
| 1456 | 1058.765 |
| 1457 | 1063.458 |
| 1458 | 1059.023 |
| 1459 | 1077.571 |
| 1460 | 1080.371 |
| 1461 | 1087.826 |
| 1462 | 1114.209 |
| 1463 | 1113.104 |
| 1464 | 1138.421 |
| 1465 | 1112.999 |
| 1466 | 1080.649 |
| 1467 | 1094.187 |
| 1468 | 1120.554 |
| 1469 | 1119.646 |
| 1470 | 1118.067 |
| 1471 | 1124.725 |
| 1472 | 1125.82 |
| 1473 | 1125.219 |
| 1474 | 1114.527 |
| 1475 | 1124.602 |
| 1476 | 1117.713 |
| 1477 | 1122.966 |
| 1478 | 1113.513 |
| 1479 | 1092.627 |
| 1480 | 1100.319 |
| 1481 | 1108.799 |
| 1482 | 1104.183 |
| 1483 | 1122.55 |
| 1484 | 1131.054 |
| 1485 | 1116.661 |
| 1486 | 1116.661 |
| 1487 | 1110.703 |
| 1488 | 1122.577 |
| 1489 | 1143.658 |
| 1490 | 1143.658 |
| 1491 | 1152.793 |
| 1492 | 1154.37 |
| 1493 | 1152.199 |
| 1494 | 1169.903 |
| 1495 | 1167.614 |
| 1496 | 1167.968 |
| 1497 | 1151.248 |
| 1498 | 1162.419 |
| 1499 | 1168.28 |
| 1500 | 1168.12 |
| 1501 | 1183.11 |
| 1502 | 1187.606 |
| 1503 | 1199.125 |
| 1504 | 1195.81 |
| 1505 | 1195.65 |
| 1506 | 1195.018 |
| 1507 | 1191.427 |
| 1508 | 1191.465 |
| 1509 | 1193.097 |
| 1510 | 1175.659 |
| 1511 | 1179.682 |
| 1512 | 1190.924 |
| 1513 | 1178.851 |
| 1514 | 1187.529 |
| 1515 | 1199.481 |
| 1516 | 1209.106 |
| 1517 | 1210.683 |
| 1518 | 1204.725 |
| 1519 | 1200.503 |
| 1520 | 1199.121 |
| 1521 | 1206.852 |
| 1522 | 1216.319 |
| 1523 | 1224.918 |
| 1524 | 1227.82 |
| 1525 | 1233.382 |
| 1526 | 1233.222 |
| 1527 | 1227.303 |
| 1528 | 1228.588 |
| 1529 | 1235.483 |
| 1530 | 1239.348 |
| 1531 | 1275.451 |
| 1532 | 1290.37 |
| 1533 | 1296.918 |
| 1534 | 1297.824 |
| 1535 | 1284.765 |
| 1536 | 1275.69 |
| 1537 | 1271.231 |
| 1538 | 1252.294 |
| 1539 | 1254.597 |
| 1540 | 1258.58 |
| 1541 | 1258.193 |
| 1542 | 1274.966 |
| 1543 | 1272.992 |
| 1544 | 1266.6 |
| 1545 | 1255.08 |
| 1546 | 1255.828 |
| 1547 | 1246.832 |
| 1548 | 1248.054 |
| 1549 | 1262.121 |
| 1550 | 1270.444 |
| 1551 | 1267.957 |
| 1552 | 1264.761 |
| 1553 | 1253.438 |
| 1554 | 1242.556 |
| 1555 | 1244.488 |
| 1556 | 1249.095 |
| 1557 | 1238.127 |
| 1558 | 1230.354 |
| 1559 | 1246.764 |
| 1560 | 1237.674 |
| 1561 | 1227.944 |
| 1562 | 1231.036 |
| 1563 | 1234.27 |
| 1564 | 1244.975 |
| 1565 | 1250.931 |
| 1566 | 1251.246 |
| 1567 | 1255.466 |
| 1568 | 1275.197 |
| 1569 | 1270.147 |
| 1570 | 1275.353 |
| 1571 | 1271.525 |
| 1572 | 1274.641 |
| 1573 | 1263.239 |
| 1574 | 1256.673 |
| 1575 | 1261.958 |
| 1576 | 1273.855 |
| 1577 | 1265.096 |
| 1578 | 1264.936 |
| 1579 | 1264.776 |
| 1580 | 1262.511 |
| 1581 | 1249.807 |
| 1582 | 1240.535 |
| 1583 | 1223.412 |
| 1584 | 1222.22 |
| 1585 | 1233.541 |
| 1586 | 1244.389 |
| 1587 | 1243.102 |
| 1588 | 1226.153 |
| 1589 | 1231.556 |
| 1590 | 1244.455 |
| 1591 | 1250.648 |
| 1592 | 1260.257 |
| 1593 | 1267.475 |
| 1594 | 1252.159 |
| 1595 | 1249.318 |
| 1596 | 1257.759 |
| 1597 | 1261.174 |
| 1598 | 1264.164 |
| 1599 | 1257.59 |
| 1600 | 1274.197 |
| 1601 | 1285.834 |
| 1602 | 1290.228 |
| 1603 | 1295.56 |
| 1604 | 1295.4 |
| 1605 | 1297.569 |
| 1606 | 1300.779 |
| 1607 | 1289.874 |
| 1608 | 1291.467 |
| 1609 | 1293.146 |
| 1610 | 1288.364 |
| 1611 | 1285.009 |
| 1612 | 1295.281 |
| 1613 | 1301.489 |
| 1614 | 1304.542 |
| 1615 | 1303.712 |
| 1616 | 1314.678 |
| 1617 | 1311.371 |
| 1618 | 1307.693 |
| 1619 | 1318.194 |
| 1620 | 1318.579 |
| 1621 | 1317.742 |
| 1622 | 1311.697 |
| 1623 | 1316.312 |
| 1624 | 1316.152 |
| 1625 | 1311.196 |
| 1626 | 1301.939 |
| 1627 | 1299.548 |
| 1628 | 1313.82 |
| 1629 | 1326.182 |
| 1630 | 1326.355 |
| 1631 | 1325.951 |
| 1632 | 1321.161 |
| 1633 | 1308.173 |
| 1634 | 1311.549 |
| 1635 | 1312.123 |
| 1636 | 1315.018 |
| 1637 | 1323.333 |
| 1638 | 1330.007 |
| 1639 | 1320.845 |
| 1640 | 1320.845 |
| 1641 | 1320.685 |
| 1642 | 1318.357 |
| 1643 | 1324.021 |
| 1644 | 1323.861 |
| 1645 | 1323.292 |
| 1646 | 1319.961 |
| 1647 | 1326.698 |
| 1648 | 1329.577 |
| 1649 | 1331.911 |
| 1650 | 1323.349 |
| 1651 | 1320.31 |
| 1652 | 1319.291 |
| 1653 | 1322.628 |
| 1654 | 1322.468 |
| 1655 | 1333.884 |
| 1656 | 1340.005 |
| 1657 | 1338.016 |
| 1658 | 1336.871 |
| 1659 | 1340.594 |
| 1660 | 1343.512 |
| 1661 | 1347.606 |
| 1662 | 1349.829 |
| 1663 | 1347.414 |
| 1664 | 1344.675 |
| 1665 | 1353.337 |
| 1666 | 1357.66 |
| 1667 | 1363.095 |
| 1668 | 1361.279 |
| 1669 | 1355.211 |
| 1670 | 1357.853 |
| 1671 | 1361.773 |
| 1672 | 1369.496 |
| 1673 | 1366.994 |
| 1674 | 1366.834 |
| 1675 | 1360.797 |
| 1676 | 1363.186 |
| 1677 | 1371.225 |
| 1678 | 1376.14 |
| 1679 | 1379.76 |
| 1680 | 1379.6 |
| 1681 | 1373.595 |
| 1682 | 1371.661 |
| 1683 | 1368.259 |
| 1684 | 1372.795 |
| 1685 | 1372.635 |
| 1686 | 1378.093 |
| 1687 | 1376.719 |
| 1688 | 1374.738 |
| 1689 | 1365.261 |
| 1690 | 1370.917 |
| 1691 | 1378.601 |
| 1692 | 1369.234 |
| 1693 | 1377.091 |
| 1694 | 1372.483 |
| 1695 | 1372.323 |
| 1696 | 1383.162 |
| 1697 | 1383.863 |
| 1698 | 1382.032 |
| 1699 | 1391.16 |
| 1700 | 1391.293 |
| 1701 | 1390.96 |
| 1702 | 1380.173 |
| 1703 | 1375.983 |
| 1704 | 1375.823 |
| 1705 | 1383.222 |
| 1706 | 1389.904 |
| 1707 | 1392.822 |
| 1708 | 1387.685 |
| 1709 | 1395.842 |
| 1710 | 1395.21 |
| 1711 | 1408.361 |
| 1712 | 1417.284 |
| 1713 | 1419.492 |
| 1714 | 1418.923 |
| 1715 | 1425.005 |
| 1716 | 1427.844 |
| 1717 | 1428.348 |
| 1718 | 1412.788 |
| 1719 | 1415.051 |
| 1720 | 1405.353 |
| 1721 | 1405.353 |
| 1722 | 1405.849 |
| 1723 | 1396.483 |
| 1724 | 1396.483 |
| 1725 | 1396.323 |
| 1726 | 1395.611 |
| 1727 | 1380.288 |
| 1728 | 1379.853 |
| 1729 | 1377.445 |
| 1730 | 1375.109 |
| 1731 | 1381.672 |
| 1732 | 1378.389 |
| 1733 | 1378.411 |
| 1734 | 1377.653 |
| 1735 | 1375.577 |
| 1736 | 1374.274 |
| 1737 | 1372.979 |
| 1738 | 1373.838 |
| 1739 | 1382.405 |
| 1740 | 1386.057 |
| 1741 | 1389.385 |
| 1742 | 1397.259 |
| 1743 | 1389.131 |
| 1744 | 1395.726 |
| 1745 | 1397.95 |
| 1746 | 1399.842 |
| 1747 | 1398.815 |
| 1748 | 1389.812 |
| 1749 | 1387.483 |
| 1750 | 1379.821 |
| 1751 | 1394.006 |
| 1752 | 1395.638 |
| 1753 | 1399.7 |
| 1754 | 1400.141 |
| 1755 | 1393.788 |
| 1756 | 1389.756 |
| 1757 | 1385.541 |
| 1758 | 1376.932 |
| 1759 | 1382.225 |
| 1760 | 1379.486 |
| 1761 | 1385.008 |
| 1762 | 1371.491 |
| 1763 | 1375.001 |
| 1764 | 1374.306 |
| 1765 | 1385.982 |
| 1766 | 1380.963 |
| 1767 | 1377.561 |
| 1768 | 1372.637 |
| 1769 | 1370.34 |
| 1770 | 1383.712 |
| 1771 | 1370.708 |
| 1772 | 1376.869 |
| 1773 | 1383.496 |
| 1774 | 1386.556 |
| 1775 | 1379.462 |
| 1776 | 1381.615 |
| 1777 | 1381.455 |
| 1778 | 1387.908 |
| 1779 | 1392.806 |
| 1780 | 1397.097 |
| 1781 | 1396.937 |
| 1782 | 1406.002 |
| 1783 | 1406.002 |
| 1784 | 1405.945 |
| 1785 | 1403.27 |
| 1786 | 1407.505 |
| 1787 | 1405.611 |
| 1788 | 1412.395 |
| 1789 | 1419.771 |
| 1790 | 1412.645 |
| 1791 | 1414.759 |
| 1792 | 1404.406 |
| 1793 | 1410.393 |
| 1794 | 1412.128 |
| 1795 | 1407.409 |
| 1796 | 1392.764 |
| 1797 | 1395.935 |
| 1798 | 1406.798 |
| 1799 | 1411.965 |
| 1800 | 1417.4 |
| 1801 | 1425.178 |
| 1802 | 1418.802 |
| 1803 | 1425.176 |
| 1804 | 1423.984 |
| 1805 | 1417.308 |
| 1806 | 1412.88 |
| 1807 | 1414.11 |
| 1808 | 1424.8 |
| 1809 | 1420.088 |
| 1810 | 1418.209 |
| 1811 | 1421.333 |
| 1812 | 1414.949 |
| 1813 | 1420.313 |
| 1814 | 1419.278 |
| 1815 | 1414.93 |
| 1816 | 1411.283 |
| 1817 | 1403.708 |
| 1818 | 1403.708 |
| 1819 | 1403.312 |
| 1820 | 1386.924 |
| 1821 | 1383.049 |
| 1822 | 1382.889 |
| 1823 | 1387.7 |
| 1824 | 1395.905 |
| 1825 | 1379.374 |
| 1826 | 1393.015 |
| 1827 | 1408.163 |
| 1828 | 1397.81 |
| 1829 | 1398.109 |
| 1830 | 1407.82 |
| 1831 | 1403.921 |
| 1832 | 1397.498 |
| 1833 | 1383.744 |
| 1834 | 1383.744 |
| 1835 | 1398.86 |
| 1836 | 1398.86 |
| 1837 | 1404.651 |
| 1838 | 1397.896 |
| 1839 | 1413.32 |
| 1840 | 1411.18 |
| 1841 | 1397.742 |
| 1842 | 1412.077 |
| 1843 | 1419.004 |
| 1844 | 1421.243 |
| 1845 | 1415.191 |
| 1846 | 1416.768 |
| 1847 | 1409.808 |
| 1848 | 1394.192 |
| 1849 | 1397.181 |
| 1850 | 1400.723 |
| 1851 | 1400.563 |
| 1852 | 1411.931 |
| 1853 | 1413.066 |
| 1854 | 1421.081 |
| 1855 | 1412.117 |
| 1856 | 1413.765 |
| 1857 | 1420.029 |
| 1858 | 1419.869 |
| 1859 | 1413.027 |
| 1860 | 1409.791 |
| 1861 | 1413.112 |
| 1862 | 1414.965 |
| 1863 | 1417.78 |
| 1864 | 1410.023 |
| 1865 | 1417.013 |
| 1866 | 1412.759 |
| 1867 | 1435.663 |
| 1868 | 1438.462 |
| 1869 | 1436.946 |
| 1870 | 1443.573 |
| 1871 | 1443.413 |
| 1872 | 1448.106 |
| 1873 | 1443.529 |
| 1874 | 1440.262 |
| 1875 | 1450.352 |
| 1876 | 1448.836 |
| 1877 | 1465.088 |
| 1878 | 1466.554 |
| 1879 | 1467.737 |
| 1880 | 1462.71 |
| 1881 | 1452.973 |
| 1882 | 1441.941 |
| 1883 | 1440.544 |
| 1884 | 1447.951 |
| 1885 | 1447.791 |
| 1886 | 1447.695 |
| 1887 | 1454.211 |
| 1888 | 1454.051 |
| 1889 | 1463.889 |
| 1890 | 1460.046 |
| 1891 | 1454.506 |
| 1892 | 1454.506 |
| 1893 | 1461.369 |
| 1894 | 1466.457 |
| 1895 | 1462.937 |
| 1896 | 1438.185 |
| 1897 | 1441.064 |
| 1898 | 1434.861 |
| 1899 | 1440.249 |
| 1900 | 1435.308 |
| 1901 | 1435.148 |
| 1902 | 1432.709 |
| 1903 | 1423.682 |
| 1904 | 1419.902 |
| 1905 | 1417.407 |
| 1906 | 1420.018 |
| 1907 | 1415.543 |
| 1908 | 1411.976 |
| 1909 | 1419.683 |
| 1910 | 1421.134 |
| 1911 | 1420.974 |
| 1912 | 1419.529 |
| 1913 | 1425.003 |
| 1914 | 1426.194 |
| 1915 | 1410.823 |
| 1916 | 1407.745 |
| 1917 | 1407.585 |
| 1918 | 1406.392 |
| 1919 | 1422.597 |
| 1920 | 1431.599 |
| 1921 | 1430.461 |
| 1922 | 1435.762 |
| 1923 | 1433.331 |
| 1924 | 1433.653 |
| 1925 | 1449.59 |
| 1926 | 1438.259 |
| 1927 | 1445.469 |
| 1928 | 1445.469 |
| 1929 | 1447.938 |
| 1930 | 1458.02 |
| 1931 | 1454.705 |
| 1932 | 1455.233 |
| 1933 | 1467.485 |
| 1934 | 1475.894 |
| 1935 | 1463.719 |
| 1936 | 1456.585 |
| 1937 | 1456.269 |
| 1938 | 1457.12 |
| 1939 | 1451.304 |
| 1940 | 1451.304 |
| 1941 | 1454.017 |
| 1942 | 1463.72 |
| 1943 | 1472.233 |
| 1944 | 1475.853 |
| 1945 | 1459.362 |
| 1946 | 1440.646 |
| 1947 | 1437.094 |
| 1948 | 1439.712 |
| 1949 | 1440.058 |
| 1950 | 1431.694 |
| 1951 | 1424.481 |
| 1952 | 1437.246 |
| 1953 | 1435.88 |
| 1954 | 1431.098 |
| 1955 | 1442.103 |
| 1956 | 1433.723 |
| 1957 | 1428.207 |
| 1958 | 1414.264 |
| 1959 | 1425.293 |
| 1960 | 1413.583 |
| 1961 | 1414.308 |
| 1962 | 1405.099 |
| 1963 | 1407 |
| 1964 | 1397.546 |
| 1965 | 1389.758 |
| 1966 | 1393.031 |
| 1967 | 1392.871 |
| 1968 | 1390.329 |
| 1969 | 1383.109 |
| 1970 | 1362.728 |
| 1971 | 1365.204 |
| 1972 | 1367.081 |
| 1973 | 1376.343 |
| 1974 | 1364.081 |
| 1975 | 1352.813 |
| 1976 | 1365.049 |
| 1977 | 1370.547 |
| 1978 | 1354.301 |
| 1979 | 1348.69 |
| 1980 | 1344.917 |
| 1981 | 1344.979 |
| 1982 | 1343.077 |
| 1983 | 1341.742 |
| 1984 | 1357.15 |
| 1985 | 1357.93 |
| 1986 | 1344.871 |
| 1987 | 1342.393 |
| 1988 | 1338.013 |
| 1989 | 1333.94 |
| 1990 | 1331.462 |
| 1991 | 1331.279 |
| 1992 | 1332.241 |
| 1993 | 1332.76 |
| 1994 | 1336.822 |
| 1995 | 1340.632 |
| 1996 | 1349.247 |
| 1997 | 1344.267 |
| 1998 | 1336.353 |
| 1999 | 1334.994 |
| 2000 | 1330.748 |
| 2001 | 1318.384 |
| 2002 | 1329.855 |
| 2003 | 1337.333 |
| 2004 | 1343.273 |
| 2005 | 1341.426 |
| 2006 | 1353.891 |
| 2007 | 1372.053 |
| 2008 | 1373.819 |
| 2009 | 1366.796 |
| 2010 | 1374.077 |
| 2011 | 1373.917 |
| 2012 | 1373.757 |
| 2013 | 1385.41 |
| 2014 | 1385.472 |
| 2015 | 1388.832 |
| 2016 | 1391.237 |
| 2017 | 1392.767 |
| 2018 | 1383.013 |
| 2019 | 1374.546 |
| 2020 | 1385.181 |
| 2021 | 1386.545 |
| 2022 | 1372.515 |
| 2023 | 1376.657 |
| 2024 | 1378.368 |
| 2025 | 1381.696 |
| 2026 | 1390.05 |
| 2027 | 1400.227 |
| 2028 | 1404.171 |
| 2029 | 1402.695 |
| 2030 | 1402.481 |
| 2031 | 1408.831 |
| 2032 | 1405.429 |
| 2033 | 1411.93 |
| 2034 | 1413.585 |
| 2035 | 1411.517 |
| 2036 | 1419.201 |
| 2037 | 1415.097 |
| 2038 | 1414.937 |
| 2039 | 1419.023 |
| 2040 | 1418.863 |
| 2041 | 1425.797 |
| 2042 | 1417.496 |
| 2043 | 1416.043 |
| 2044 | 1414.306 |
| 2045 | 1409.263 |
| 2046 | 1408.899 |
| 2047 | 1400.219 |
| 2048 | 1391.862 |
| 2049 | 1389.557 |
| 2050 | 1389.02 |
| 2051 | 1381.129 |
| 2052 | 1371.32 |
| 2053 | 1358.798 |
| 2054 | 1356.193 |
| 2055 | 1353.793 |
| 2056 | 1345.097 |
| 2057 | 1337.956 |
| 2058 | 1344.937 |
| 2059 | 1344.937 |
| 2060 | 1347.019 |
| 2061 | 1348.044 |
| 2062 | 1350.339 |
| 2063 | 1356.271 |
| 2064 | 1356.111 |
| 2065 | 1356.205 |
| 2066 | 1364.898 |
| 2067 | 1366.68 |
| 2068 | 1380.266 |
| 2069 | 1377.424 |
| 2070 | 1380.642 |
| 2071 | 1377.832 |
| 2072 | 1381.256 |
| 2073 | 1376.599 |
| 2074 | 1376.599 |
| 2075 | 1368.448 |
| 2076 | 1353.479 |
| 2077 | 1355.822 |
| 2078 | 1356.562 |
| 2079 | 1358.115 |
| 2080 | 1363.061 |
| 2081 | 1374.359 |
| 2082 | 1371.43 |
| 2083 | 1369.962 |
| 2084 | 1371.16 |
| 2085 | 1370.757 |
| 2086 | 1370.803 |
| 2087 | 1348.031 |
| 2088 | 1365.562 |
| 2089 | 1364.748 |
| 2090 | 1368.132 |
| 2091 | 1350.922 |
| 2092 | 1346.645 |
| 2093 | 1346.485 |
| 2094 | 1352.023 |
| 2095 | 1358.318 |
| 2096 | 1357.22 |
| 2097 | 1361.905 |
| 2098 | 1373.881 |
| 2099 | 1368.065 |
| 2100 | 1372.128 |
| 2101 | 1372.955 |
| 2102 | 1377.317 |
| 2103 | 1363.564 |
| 2104 | 1366.545 |
| 2105 | 1375.641 |
| 2106 | 1380.926 |
| 2107 | 1393.581 |
| 2108 | 1381.997 |
| 2109 | 1384.434 |
| 2110 | 1393.514 |
| 2111 | 1401.987 |
| 2112 | 1407.588 |
| 2113 | 1394.781 |
| 2114 | 1387.805 |
| 2115 | 1389.958 |
| 2116 | 1369.214 |
| 2117 | 1366.752 |
| 2118 | 1374.514 |
| 2119 | 1374.354 |
| 2120 | 1382.551 |
| 2121 | 1386.795 |
| 2122 | 1378.903 |
| 2123 | 1373.569 |
| 2124 | 1381.189 |
| 2125 | 1374.419 |
| 2126 | 1369.25 |
| 2127 | 1363.844 |
| 2128 | 1363.684 |
| 2129 | 1364.377 |
| 2130 | 1355.602 |
| 2131 | 1355.602 |
| 2132 | 1359.073 |
| 2133 | 1351.221 |
| 2134 | 1364.807 |
| 2135 | 1369.042 |
| 2136 | 1383.567 |
| 2137 | 1382.153 |
| 2138 | 1383.075 |
| 2139 | 1383.69 |
| 2140 | 1386.766 |
| 2141 | 1391.656 |
| 2142 | 1375.142 |
| 2143 | 1369.767 |
| 2144 | 1369.119 |
| 2145 | 1379.47 |
| 2146 | 1390.617 |
| 2147 | 1390.617 |
| 2148 | 1395.705 |
| 2149 | 1385.376 |
| 2150 | 1389.06 |
| 2151 | 1398.321 |
| 2152 | 1416.578 |
| 2153 | 1401.688 |
| 2154 | 1420.458 |
| 2155 | 1436.031 |
| 2156 | 1451.534 |
| 2157 | 1446.468 |
| 2158 | 1447.106 |
| 2159 | 1461.354 |
| 2160 | 1464.138 |
| 2161 | 1465.517 |
| 2162 | 1458.108 |
| 2163 | 1463.101 |
| 2164 | 1461.577 |
| 2165 | 1467.967 |
| 2166 | 1465.741 |
| 2167 | 1462.86 |
| 2168 | 1472.319 |
| 2169 | 1470.937 |
| 2170 | 1465.358 |
| 2171 | 1459.778 |
| 2172 | 1450.846 |
| 2173 | 1455.05 |
| 2174 | 1450.149 |
| 2175 | 1450.149 |
| 2176 | 1457.943 |
| 2177 | 1474.827 |
| 2178 | 1492.776 |
| 2179 | 1485.303 |
| 2180 | 1485.143 |
| 2181 | 1491.083 |
| 2182 | 1481.353 |
| 2183 | 1487.388 |
| 2184 | 1487.095 |
| 2185 | 1488.088 |
| 2186 | 1487.928 |
| 2187 | 1479.185 |
| 2188 | 1481.961 |
| 2189 | 1480.319 |
| 2190 | 1476.081 |
| 2191 | 1479.512 |
| 2192 | 1483.724 |
| 2193 | 1500.316 |
| 2194 | 1513.246 |
| 2195 | 1499.327 |
| 2196 | 1498.987 |
| 2197 | 1505.992 |
| 2198 | 1510.583 |
| 2199 | 1530.733 |
| 2200 | 1530.408 |
| 2201 | 1542.329 |
| 2202 | 1543.369 |
| 2203 | 1551.519 |
| 2204 | 1551.359 |
| 2205 | 1551.359 |
| 2206 | 1551.997 |
| 2207 | 1553.463 |
| 2208 | 1562.401 |
| 2209 | 1562.241 |
| 2210 | 1560.473 |
| 2211 | 1560.345 |
| 2212 | 1582.499 |
| 2213 | 1579.043 |
| 2214 | 1556.91 |
| 2215 | 1569.075 |
| 2216 | 1565.453 |
| 2217 | 1571.33 |
| 2218 | 1571.17 |
| 2219 | 1566.979 |
| 2220 | 1571.459 |
| 2221 | 1548.412 |
| 2222 | 1543.029 |
| 2223 | 1542.869 |
| 2224 | 1556.487 |
| 2225 | 1549.053 |
| 2226 | 1542.969 |
| 2227 | 1542.494 |
| 2228 | 1547.645 |
| 2229 | 1549.199 |
| 2230 | 1550.334 |
| 2231 | 1537.377 |
| 2232 | 1536.942 |
| 2233 | 1528.12 |
| 2234 | 1527.874 |
| 2235 | 1528.11 |
| 2236 | 1538.334 |
| 2237 | 1537.015 |
| 2238 | 1531.444 |
| 2239 | 1529.676 |
| 2240 | 1529.667 |
| 2241 | 1530.454 |
| 2242 | 1524.851 |
| 2243 | 1528.275 |
| 2244 | 1528.115 |
| 2245 | 1539.956 |
| 2246 | 1544.074 |
| 2247 | 1546.598 |
| 2248 | 1546.438 |
| 2249 | 1546.278 |
| 2250 | 1552.857 |
| 2251 | 1555.538 |
| 2252 | 1555.656 |
| 2253 | 1555.426 |
| 2254 | 1556.805 |
| 2255 | 1557.554 |
| 2256 | 1547.232 |
| 2257 | 1545.559 |
| 2258 | 1545.399 |
| 2259 | 1545.058 |
| 2260 | 1554.099 |
| 2261 | 1545.608 |
| 2262 | 1557.711 |
| 2263 | 1563.098 |
| 2264 | 1568.825 |
| 2265 | 1567.767 |
| 2266 | 1562.109 |
| 2267 | 1570.566 |
| 2268 | 1581.311 |
| 2269 | 1578.446 |
| 2270 | 1583.857 |
| 2271 | 1573.788 |
| 2272 | 1565.448 |
| 2273 | 1568.263 |
| 2274 | 1578.921 |
| 2275 | 1577.098 |
| 2276 | 1582.557 |
| 2277 | 1582.311 |
| 2278 | 1590.744 |
| 2279 | 1596.684 |
| 2280 | 1601.33 |
| 2281 | 1607.341 |
| 2282 | 1607.181 |
| 2283 | 1608.111 |
| 2284 | 1609.499 |
| 2285 | 1619.684 |
| 2286 | 1619.643 |
| 2287 | 1621.575 |
| 2288 | 1614.457 |
| 2289 | 1615.813 |
| 2290 | 1611.339 |
| 2291 | 1606.099 |
| 2292 | 1611.108 |
| 2293 | 1610.033 |
| 2294 | 1614.853 |
| 2295 | 1615.491 |
| 2296 | 1616.705 |
| 2297 | 1626.196 |
| 2298 | 1632.065 |
| 2299 | 1637.082 |
| 2300 | 1642.043 |
| 2301 | 1641.883 |
| 2302 | 1642.79 |
| 2303 | 1633.96 |
| 2304 | 1631.773 |
| 2305 | 1623.432 |
| 2306 | 1620.401 |
| 2307 | 1630.215 |
| 2308 | 1642.073 |
| 2309 | 1637.59 |
| 2310 | 1631.94 |
| 2311 | 1627.765 |
| 2312 | 1631.464 |
| 2313 | 1631.304 |
| 2314 | 1626.238 |
| 2315 | 1627.128 |
| 2316 | 1626.251 |
| 2317 | 1624.972 |
| 2318 | 1630.297 |
| 2319 | 1623.282 |
| 2320 | 1626.61 |
| 2321 | 1626.633 |
| 2322 | 1625.401 |
| 2323 | 1628.429 |
| 2324 | 1625.296 |
| 2325 | 1618.359 |
| 2326 | 1625.467 |
| 2327 | 1631.439 |
| 2328 | 1628.85 |
| 2329 | 1629.291 |
| 2330 | 1627.325 |
| 2331 | 1629.438 |
| 2332 | 1629.278 |
| 2333 | 1637.972 |
| 2334 | 1631.738 |
| 2335 | 1632.865 |
| 2336 | 1632.485 |
| 2337 | 1633.518 |
| 2338 | 1639.686 |
| 2339 | 1641.642 |
| 2340 | 1644.71 |
| 2341 | 1643.021 |
| 2342 | 1643.319 |
| 2343 | 1645.819 |
| 2344 | 1646.142 |
| 2345 | 1645.896 |
| 2346 | 1639.63 |
| 2347 | 1640.158 |
| 2348 | 1634.752 |
| 2349 | 1634.752 |
| 2350 | 1631.122 |
| 2351 | 1624.974 |
| 2352 | 1624.326 |
| 2353 | 1622.7 |
| 2354 | 1616.718 |
| 2355 | 1624.086 |
| 2356 | 1625.04 |
| 2357 | 1623.492 |
| 2358 | 1630.134 |
| 2359 | 1634.504 |
| 2360 | 1644.981 |
| 2361 | 1652.902 |
| 2362 | 1652.902 |
| 2363 | 1651.528 |
| 2364 | 1648.899 |
| 2365 | 1651.857 |
| 2366 | 1641.11 |
| 2367 | 1641.109 |
| 2368 | 1646.394 |
| 2369 | 1639.489 |
| 2370 | 1643.157 |
| 2371 | 1653.278 |
| 2372 | 1651.526 |
| 2373 | 1647.974 |
| 2374 | 1635.586 |
| 2375 | 1637.147 |
| 2376 | 1636.987 |
| 2377 | 1630.958 |
| 2378 | 1630.381 |
| 2379 | 1621.164 |
| 2380 | 1629.653 |
| 2381 | 1627.805 |
| 2382 | 1614.604 |
| 2383 | 1612.378 |
| 2384 | 1609.126 |
| 2385 | 1608.178 |
| 2386 | 1606.244 |
| 2387 | 1604.223 |
| 2388 | 1621.478 |
| 2389 | 1613.492 |
| 2390 | 1615.913 |
| 2391 | 1609.474 |
| 2392 | 1598.663 |
| 2393 | 1606.907 |
| 2394 | 1611.048 |
| 2395 | 1606.053 |
| 2396 | 1605.097 |
| 2397 | 1602.224 |
| 2398 | 1605.766 |
| 2399 | 1605.11 |
| 2400 | 1606.789 |
| 2401 | 1605.865 |
| 2402 | 1605.556 |
| 2403 | 1595.787 |
| 2404 | 1595.589 |
| 2405 | 1591.019 |
| 2406 | 1598.75 |
| 2407 | 1608.517 |
| 2408 | 1611.309 |
| 2409 | 1611.149 |
| 2410 | 1614.415 |
| 2411 | 1614.255 |
| 2412 | 1614.255 |
| 2413 | 1630.412 |
| 2414 | 1630.869 |
| 2415 | 1630.655 |
| 2416 | 1627.939 |
| 2417 | 1623.212 |
| 2418 | 1621.878 |
| 2419 | 1625.103 |
| 2420 | 1624.219 |
| 2421 | 1621.653 |
| 2422 | 1626.733 |
| 2423 | 1628.547 |
| 2424 | 1628.254 |
| 2425 | 1638.178 |
| 2426 | 1633.562 |
| 2427 | 1633.402 |
| 2428 | 1629.243 |
| 2429 | 1628.287 |
| 2430 | 1633.391 |
| 2431 | 1636.025 |
| 2432 | 1634.083 |
| 2433 | 1639.368 |
| 2434 | 1637.292 |
| 2435 | 1635.097 |
| 2436 | 1637.739 |
| 2437 | 1640.081 |
| 2438 | 1654.598 |
| 2439 | 1650.636 |
| 2440 | 1642.926 |
| 2441 | 1639.335 |
| 2442 | 1646.309 |
| 2443 | 1635.049 |
| 2444 | 1635.032 |
| 2445 | 1629.508 |
| 2446 | 1629.31 |
| 2447 | 1622.941 |
| 2448 | 1622.017 |
| 2449 | 1618.402 |
| 2450 | 1615.916 |
| 2451 | 1613.753 |
| 2452 | 1616.86 |
| 2453 | 1612.528 |
| 2454 | 1615.864 |
| 2455 | 1618.262 |
| 2456 | 1617.077 |
| 2457 | 1625.865 |
| 2458 | 1624.444 |
| 2459 | 1620.009 |
| 2460 | 1620.009 |
| 2461 | 1620.734 |
| 2462 | 1624.764 |
| 2463 | 1622.672 |
| 2464 | 1622.253 |
| 2465 | 1630.45 |
| 2466 | 1635.522 |
| 2467 | 1639.616 |
| 2468 | 1639.616 |
| 2469 | 1642.731 |
| 2470 | 1636.899 |
| 2471 | 1637.9 |
| 2472 | 1634.712 |
| 2473 | 1635.184 |
| 2474 | 1632.232 |
| 2475 | 1636.57 |
| 2476 | 1636.467 |
| 2477 | 1635.014 |
| 2478 | 1626.468 |
| 2479 | 1628.155 |
| 2480 | 1629.487 |
| 2481 | 1626.023 |
| 2482 | 1624.049 |
| 2483 | 1621.176 |
| 2484 | 1621.072 |
| 2485 | 1620.566 |
| 2486 | 1622.932 |
| 2487 | 1619.262 |
| 2488 | 1622.149 |
| 2489 | 1627.316 |
| 2490 | 1627.52 |
| 2491 | 1628.394 |
| 2492 | 1632.749 |
| 2493 | 1625.615 |
| 2494 | 1625.977 |
| 2495 | 1623.577 |
| 2496 | 1624.27 |
| 2497 | 1626.297 |
| 2498 | 1626.793 |
| 2499 | 1632.307 |
| 2500 | 1628.984 |
| 2501 | 1626.805 |
| 2502 | 1634.663 |
| 2503 | 1637.857 |
| 2504 | 1641.848 |
| 2505 | 1646.865 |
| 2506 | 1641.341 |
| 2507 | 1640.977 |
| 2508 | 1647.667 |
| 2509 | 1647.681 |
| 2510 | 1652.706 |
| 2511 | 1652.729 |
| 2512 | 1654.037 |
| 2513 | 1649.452 |
| 2514 | 1648.252 |
| 2515 | 1647.643 |
| 2516 | 1651.264 |
| 2517 | 1650.268 |
| 2518 | 1648.508 |
| 2519 | 1647.221 |
| 2520 | 1647.291 |
| 2521 | 1646.587 |
| 2522 | 1635.651 |
| 2523 | 1634.056 |
| 2524 | 1637.226 |
| 2525 | 1639.908 |
| 2526 | 1638.502 |
| 2527 | 1654.849 |
| 2528 | 1660.324 |
| 2529 | 1658.792 |
| 2530 | 1652.866 |
| 2531 | 1652.866 |
| 2532 | 1659.484 |
| 2533 | 1663.799 |
| 2534 | 1663.845 |
| 2535 | 1664.491 |
| 2536 | 1664.119 |
| 2537 | 1668.702 |
| 2538 | 1668.542 |
| 2539 | 1669.228 |
| 2540 | 1671.98 |
| 2541 | 1677.857 |
| 2542 | 1677.697 |
| 2543 | 1682.501 |
| 2544 | 1693.404 |
| 2545 | 1687.824 |
| 2546 | 1692.605 |
| 2547 | 1702.379 |
| 2548 | 1704.682 |
| 2549 | 1707.656 |
| 2550 | 1711.3 |
| 2551 | 1711.14 |
| 2552 | 1704.132 |
| 2553 | 1704.139 |
| 2554 | 1704.106 |
| 2555 | 1706.969 |
| 2556 | 1706.809 |
| 2557 | 1713.933 |
| 2558 | 1713.963 |
| 2559 | 1701.756 |
| 2560 | 1701.779 |
| 2561 | 1707.758 |
| 2562 | 1714.125 |
| 2563 | 1711.031 |
| 2564 | 1712.055 |
| 2565 | 1713.987 |
| 2566 | 1720.566 |
| 2567 | 1731.524 |
| 2568 | 1723.365 |
| 2569 | 1723.365 |
| 2570 | 1724.185 |
| 2571 | 1718.345 |
| 2572 | 1721.713 |
| 2573 | 1716.094 |
| 2574 | 1712.045 |
| 2575 | 1717.875 |
| 2576 | 1721.85 |
| 2577 | 1724.414 |
| 2578 | 1731.379 |
| 2579 | 1738.803 |
| 2580 | 1738.084 |
| 2581 | 1731.668 |
| 2582 | 1734.484 |
| 2583 | 1734.324 |
| 2584 | 1737.81 |
| 2585 | 1737.65 |
| 2586 | 1739.905 |
| 2587 | 1739.745 |
| 2588 | 1735.065 |
| 2589 | 1732.224 |
| 2590 | 1737.99 |
| 2591 | 1738.881 |
| 2592 | 1741.247 |
| 2593 | 1742.003 |
| 2594 | 1735.548 |
| 2595 | 1724.241 |
| 2596 | 1712.602 |
| 2597 | 1711.007 |
| 2598 | 1711.053 |
| 2599 | 1710.2 |
| 2600 | 1704.747 |
| 2601 | 1704.747 |
| 2602 | 1704.28 |
| 2603 | 1705.486 |
| 2604 | 1709.075 |
| 2605 | 1703.496 |
| 2606 | 1702.398 |
| 2607 | 1693.252 |
| 2608 | 1689.346 |
| 2609 | 1689.186 |
| 2610 | 1689.342 |
| 2611 | 1695.062 |
| 2612 | 1703.716 |
| 2613 | 1707.77 |
| 2614 | 1707.872 |
| 2615 | 1703.381 |
| 2616 | 1700.737 |
| 2617 | 1700.262 |
| 2618 | 1696.782 |
| 2619 | 1699.763 |
| 2620 | 1697.742 |
| 2621 | 1697.582 |
| 2622 | 1703.427 |
| 2623 | 1703.379 |
| 2624 | 1702.865 |
| 2625 | 1696.899 |
| 2626 | 1690.065 |
| 2627 | 1681.48 |
| 2628 | 1677.202 |
| 2629 | 1683.624 |
| 2630 | 1683.165 |
| 2631 | 1684.016 |
| 2632 | 1695.992 |
| 2633 | 1693.805 |
| 2634 | 1698.949 |
| 2635 | 1703.334 |
| 2636 | 1705.172 |
| 2637 | 1708.121 |
| 2638 | 1705.722 |
| 2639 | 1707.141 |
| 2640 | 1709.065 |
| 2641 | 1701.308 |
| 2642 | 1707.098 |
| 2643 | 1714.821 |
| 2644 | 1712.524 |
| 2645 | 1709.399 |
| 2646 | 1703.898 |
| 2647 | 1705.917 |
| 2648 | 1703.58 |
| 2649 | 1707.374 |
| 2650 | 1714.017 |
| 2651 | 1711.507 |
| 2652 | 1719.096 |
| 2653 | 1725.572 |
| 2654 | 1730.21 |
| 2655 | 1737.192 |
| 2656 | 1752.647 |
| 2657 | 1761.956 |
| 2658 | 1764.157 |
| 2659 | 1762.925 |
| 2660 | 1770.766 |
| 2661 | 1773.621 |
| 2662 | 1772.263 |
| 2663 | 1774.834 |
| 2664 | 1778.439 |
| 2665 | 1781.326 |
| 2666 | 1779.486 |
| 2667 | 1785.41 |
| 2668 | 1785.18 |
| 2669 | 1783.23 |
| 2670 | 1783.135 |
| 2671 | 1786.274 |
| 2672 | 1778.604 |
| 2673 | 1772.669 |
| 2674 | 1774.593 |
| 2675 | 1778.19 |
| 2676 | 1778.03 |
| 2677 | 1781.516 |
| 2678 | 1781.356 |
| 2679 | 1781.356 |
| 2680 | 1781.356 |
| 2681 | 1780.661 |
| 2682 | 1787.769 |
| 2683 | 1789.14 |
| 2684 | 1789.4 |
| 2685 | 1795.861 |
| 2686 | 1800.657 |
| 2687 | 1800.513 |
| 2688 | 1802.288 |
| 2689 | 1800.882 |
| 2690 | 1802.672 |
| 2691 | 1798.355 |
| 2692 | 1806.047 |
| 2693 | 1807.553 |
| 2694 | 1805.879 |
| 2695 | 1804.181 |
| 2696 | 1806.965 |
| 2697 | 1813.734 |
| 2698 | 1809.196 |
| 2699 | 1801.81 |
| 2700 | 1800.712 |
| 2701 | 1804.056 |
| 2702 | 1804.805 |
| 2703 | 1804.251 |
| 2704 | 1802.649 |
| 2705 | 1800.651 |
| 2706 | 1813.448 |
| 2707 | 1813.968 |
| 2708 | 1813.327 |
| 2709 | 1809.042 |
| 2710 | 1807.439 |
| 2711 | 1811.47 |
| 2712 | 1808.447 |
| 2713 | 1810.963 |
| 2714 | 1813.534 |
| 2715 | 1813.509 |
| 2716 | 1817.548 |
| 2717 | 1817.388 |
| 2718 | 1812.487 |
| 2719 | 1811.034 |
| 2720 | 1810.331 |
| 2721 | 1806.4 |
| 2722 | 1806.4 |
| 2723 | 1807.977 |
| 2724 | 1807.817 |
| 2725 | 1804.786 |
| 2726 | 1804.786 |
| 2727 | 1815.902 |
| 2728 | 1816.525 |
| 2729 | 1816.074 |
| 2730 | 1823.978 |
| 2731 | 1824.293 |
| 2732 | 1826.193 |
| 2733 | 1826.208 |
| 2734 | 1824.487 |
| 2735 | 1821.243 |
| 2736 | 1820.413 |
| 2737 | 1808.317 |
| 2738 | 1815.969 |
| 2739 | 1813.735 |
| 2740 | 1810.499 |
| 2741 | 1813.449 |
| 2742 | 1813.289 |
| 2743 | 1817.477 |
| 2744 | 1821.295 |
| 2745 | 1818.88 |
| 2746 | 1818.72 |
| 2747 | 1820.825 |
| 2748 | 1823.546 |
| 2749 | 1822.717 |
| 2750 | 1825.224 |
| 2751 | 1833.019 |
| 2752 | 1829.546 |
| 2753 | 1823.548 |
| 2754 | 1826.025 |
| 2755 | 1830.34 |
| 2756 | 1829.684 |
| 2757 | 1831.623 |
| 2758 | 1830.407 |
| 2759 | 1826.927 |
| 2760 | 1823.123 |
| 2761 | 1822.688 |
| 2762 | 1828.478 |
| 2763 | 1825.534 |
| 2764 | 1827.387 |
| 2765 | 1829.058 |
| 2766 | 1830.943 |
| 2767 | 1828.283 |
| 2768 | 1829.221 |
| 2769 | 1831.602 |
| 2770 | 1832.169 |
| 2771 | 1825.375 |
| 2772 | 1827.062 |
| 2773 | 1827.74 |
| 2774 | 1829.498 |
| 2775 | 1827.848 |
| 2776 | 1828.155 |
| 2777 | 1828.927 |
| 2778 | 1833.368 |
| 2779 | 1829.627 |
| 2780 | 1833.973 |
| 2781 | 1833.973 |
| 2782 | 1827.305 |
| 2783 | 1833.884 |
| 2784 | 1831.106 |
| 2785 | 1832.004 |
| 2786 | 1828.768 |
| 2787 | 1831.284 |
| 2788 | 1826.62 |
| 2789 | 1827.124 |
| 2790 | 1827.675 |
| 2791 | 1821.756 |
| 2792 | 1820.485 |
| 2793 | 1814.045 |
| 2794 | 1812.853 |
| 2795 | 1813.515 |
| 2796 | 1812.369 |
| 2797 | 1824.022 |
| 2798 | 1822.206 |
| 2799 | 1821.763 |
| 2800 | 1821.517 |
| 2801 | 1820.83 |
| 2802 | 1812.221 |
| 2803 | 1817.68 |
| 2804 | 1820.779 |
| 2805 | 1821.22 |
| 2806 | 1822.324 |
| 2807 | 1826.733 |
| 2808 | 1823.15 |
| 2809 | 1820.758 |
| 2810 | 1820.094 |
| 2811 | 1816.503 |
| 2812 | 1823.272 |
| 2813 | 1822.276 |
| 2814 | 1822.07 |
| 2815 | 1826.061 |
| 2816 | 1827.97 |
| 2817 | 1826.754 |
| 2818 | 1828.173 |
| 2819 | 1828.258 |
| 2820 | 1828.975 |
| 2821 | 1824.319 |
| 2822 | 1822.401 |
| 2823 | 1829.453 |
| 2824 | 1827.424 |
| 2825 | 1826.674 |
| 2826 | 1825.789 |
| 2827 | 1835.84 |
| 2828 | 1836.904 |
| 2829 | 1836.911 |
| 2830 | 1835.521 |
| 2831 | 1838.865 |
| 2832 | 1838.705 |
| 2833 | 1842.089 |
| 2834 | 1841.929 |
| 2835 | 1842.819 |
| 2836 | 1834.739 |
| 2837 | 1838.919 |
| 2838 | 1839.928 |
| 2839 | 1843.146 |
| 2840 | 1844.021 |
| 2841 | 1840.351 |
| 2842 | 1837.225 |
| 2843 | 1837.95 |
| 2844 | 1838.486 |
| 2845 | 1838.326 |
| 2846 | 1838.166 |
| 2847 | 1834.362 |
| 2848 | 1832.838 |
| 2849 | 1836.316 |
| 2850 | 1831.873 |
| 2851 | 1827.193 |
| 2852 | 1824.667 |
| 2853 | 1824.507 |
| 2854 | 1822.636 |
| 2855 | 1823.053 |
| 2856 | 1823.052 |
| 2857 | 1822.814 |
| 2858 | 1822.277 |
| 2859 | 1820.666 |
| 2860 | 1821.541 |
| 2861 | 1822.4 |
| 2862 | 1823.456 |
| 2863 | 1823.502 |
| 2864 | 1823.919 |
| 2865 | 1820.738 |
| 2866 | 1816.335 |
| 2867 | 1815.986 |
| 2868 | 1816.025 |
| 2869 | 1815.408 |
| 2870 | 1819.47 |
| 2871 | 1818.041 |
| 2872 | 1812.407 |
| 2873 | 1818.97 |
| 2874 | 1818.535 |
| 2875 | 1814.194 |
| 2876 | 1813.207 |
| 2877 | 1812.717 |
| 2878 | 1811.343 |
| 2879 | 1812.541 |
| 2880 | 1812.381 |
| 2881 | 1811.141 |
| 2882 | 1808.647 |
| 2883 | 1806.358 |
| 2884 | 1808.029 |
| 2885 | 1808.841 |
| 2886 | 1805.313 |
| 2887 | 1806.124 |
| 2888 | 1803.543 |
| 2889 | 1806.572 |
| 2890 | 1806.572 |
| 2891 | 1808.772 |
| 2892 | 1813.576 |
| 2893 | 1812.036 |
| 2894 | 1808.043 |
| 2895 | 1811.608 |
| 2896 | 1811.608 |
| 2897 | 1813.193 |
| 2898 | 1814.431 |
| 2899 | 1816.938 |
| 2900 | 1818.926 |
| 2901 | 1822.68 |
| 2902 | 1821.709 |
| 2903 | 1821.045 |
| 2904 | 1822.172 |
| 2905 | 1822.21 |
| 2906 | 1823.992 |
| 2907 | 1823.832 |
| 2908 | 1826.695 |
| 2909 | 1822.789 |
| 2910 | 1823.766 |
| 2911 | 1822.155 |
| 2912 | 1818.185 |
| 2913 | 1819.336 |
| 2914 | 1820.022 |
| 2915 | 1820.533 |
| 2916 | 1822.781 |
| 2917 | 1825.297 |
| 2918 | 1825.446 |
| 2919 | 1826.92 |
| 2920 | 1822.808 |
| 2921 | 1826.05 |
| 2922 | 1825.836 |
| 2923 | 1825.535 |
| 2924 | 1825.076 |
| 2925 | 1820.428 |
| 2926 | 1820.553 |
| 2927 | 1820.496 |
| 2928 | 1817.679 |
| 2929 | 1818.301 |
| 2930 | 1820.667 |
| 2931 | 1819.664 |
| 2932 | 1819.102 |
| 2933 | 1821.871 |
| 2934 | 1821.136 |
| 2935 | 1817.458 |
| 2936 | 1816.857 |
| 2937 | 1818.284 |
| 2938 | 1821.81 |
| 2939 | 1819.939 |
| 2940 | 1818.596 |
| 2941 | 1818.114 |
| 2942 | 1818.081 |
| 2943 | 1820.613 |
| 2944 | 1822.695 |
| 2945 | 1822.695 |
| 2946 | 1827.436 |
| 2947 | 1825.659 |
| 2948 | 1828.822 |
| 2949 | 1828.513 |
| 2950 | 1826.461 |
| 2951 | 1828.409 |
| 2952 | 1829.181 |
| 2953 | 1825.108 |
| 2954 | 1825.108 |
| 2955 | 1825.431 |
| 2956 | 1824.017 |
| 2957 | 1840.222 |
| 2958 | 1839.59 |
| 2959 | 1839.43 |
| 2960 | 1842.711 |
| 2961 | 1844.241 |
| 2962 | 1844.713 |
| 2963 | 1847.663 |
| 2964 | 1850.123 |
| 2965 | 1851.606 |
| 2966 | 1851.446 |
| 2967 | 1846.868 |
| 2968 | 1854.197 |
| 2969 | 1854.197 |
| 2970 | 1854.037 |
| 2971 | 1848.726 |
| 2972 | 1846.287 |
| 2973 | 1840.826 |
| 2974 | 1840.826 |
| 2975 | 1836.422 |
| 2976 | 1835.711 |
| 2977 | 1839.276 |
| 2978 | 1851.315 |
| 2979 | 1839.881 |
| 2980 | 1840.922 |
| 2981 | 1845.962 |
| 2982 | 1849.283 |
| 2983 | 1844.216 |
| 2984 | 1853.628 |
| 2985 | 1846.147 |
| 2986 | 1860.269 |
| 2987 | 1857.917 |
| 2988 | 1853.955 |
| 2989 | 1857.765 |
| 2990 | 1851.065 |
| 2991 | 1845.675 |
| 2992 | 1845.39 |
| 2993 | 1847.125 |
| 2994 | 1848.828 |
| 2995 | 1851.612 |
| 2996 | 1843.429 |
| 2997 | 1844.801 |
| 2998 | 1837.557 |
| 2999 | 1835.457 |
| 3000 | 1840.426 |
| 3001 | 1845.072 |
| 3002 | 1836.258 |
| 3003 | 1829.985 |
| 3004 | 1833.976 |
| 3005 | 1838.196 |
| 3006 | 1840.996 |
| 3007 | 1843.969 |
| 3008 | 1840.07 |
| 3009 | 1846.342 |
| 3010 | 1853.118 |
| 3011 | 1851.657 |
| 3012 | 1850.433 |
| 3013 | 1838.376 |
| 3014 | 1832.032 |
| 3015 | 1829.435 |
| 3016 | 1831.84 |
| 3017 | 1828.73 |
| 3018 | 1827.293 |
| 3019 | 1827.671 |
| 3020 | 1820.742 |
| 3021 | 1826.335 |
| 3022 | 1831.636 |
| 3023 | 1839.099 |
| 3024 | 1836.589 |
| 3025 | 1836.429 |
| 3026 | 1830.518 |
| 3027 | 1833.413 |
| 3028 | 1837.231 |
| 3029 | 1840.125 |
| 3030 | 1845.868 |
| 3031 | 1859.09 |
| 3032 | 1863.381 |
| 3033 | 1858.623 |
| 3034 | 1859.016 |
| 3035 | 1854.423 |
| 3036 | 1856.213 |
| 3037 | 1858.658 |
| 3038 | 1855.114 |
| 3039 | 1852.872 |
| 3040 | 1853.021 |
| 3041 | 1848.428 |
| 3042 | 1848.403 |
| 3043 | 1840.267 |
| 3044 | 1841.537 |
| 3045 | 1838.032 |
| 3046 | 1834.007 |
| 3047 | 1830.235 |
| 3048 | 1833.974 |
| 3049 | 1832.971 |
| 3050 | 1828.093 |
| 3051 | 1829.315 |
| 3052 | 1841.749 |
| 3053 | 1847.058 |
| 3054 | 1851.349 |
| 3055 | 1855.727 |
| 3056 | 1860.483 |
| 3057 | 1879.718 |
| 3058 | 1892.522 |
| 3059 | 1885.609 |
| 3060 | 1874.326 |
| 3061 | 1866.813 |
| 3062 | 1869.329 |
| 3063 | 1869.169 |
| 3064 | 1871.456 |
| 3065 | 1860.472 |
| 3066 | 1871.194 |
| 3067 | 1881.694 |
| 3068 | 1894.562 |
| 3069 | 1892.304 |
| 3070 | 1891.964 |
| 3071 | 1893.059 |
| 3072 | 1898.321 |
| 3073 | 1898.161 |
| 3074 | 1894.475 |
| 3075 | 1898.798 |
| 3076 | 1897.581 |
| 3077 | 1895.237 |
| 3078 | 1895.899 |
| 3079 | 1891.313 |
| 3080 | 1891.636 |
| 3081 | 1893.165 |
| 3082 | 1880.264 |
| 3083 | 1880.239 |
| 3084 | 1880.317 |
| 3085 | 1879.661 |
| 3086 | 1871.841 |
| 3087 | 1875.556 |
| 3088 | 1860.856 |
| 3089 | 1859.119 |
| 3090 | 1858.959 |
| 3091 | 1870.73 |
| 3092 | 1863.738 |
| 3093 | 1852.636 |
| 3094 | 1852.636 |
| 3095 | 1850.134 |
| 3096 | 1829.169 |
| 3097 | 1812.977 |
| 3098 | 1800.471 |
| 3099 | 1792.09 |
| 3100 | 1793.683 |
| 3101 | 1797.272 |
| 3102 | 1790.454 |
| 3103 | 1790.666 |
| 3104 | 1786.373 |
| 3105 | 1778.245 |
| 3106 | 1780.658 |
| 3107 | 1789.817 |
| 3108 | 1782.494 |
| 3109 | 1782.334 |
| 3110 | 1773.772 |
| 3111 | 1771.026 |
| 3112 | 1761.375 |
| 3113 | 1761.375 |
| 3114 | 1759.843 |
| 3115 | 1766.643 |
| 3116 | 1764.244 |
| 3117 | 1764.084 |
| 3118 | 1760.501 |
| 3119 | 1760.341 |
| 3120 | 1760.15 |
| 3121 | 1759.234 |
| 3122 | 1766.941 |
| 3123 | 1763.137 |
| 3124 | 1762.977 |
| 3125 | 1769.927 |
| 3126 | 1758.201 |
| 3127 | 1765.633 |
| 3128 | 1767.825 |
| 3129 | 1764.084 |
| 3130 | 1760.895 |
| 3131 | 1773.542 |
| 3132 | 1767.166 |
| 3133 | 1772.191 |
| 3134 | 1775.495 |
| 3135 | 1780.015 |
| 3136 | 1791.044 |
| 3137 | 1786.538 |
| 3138 | 1789.535 |
| 3139 | 1778.977 |
| 3140 | 1791.955 |
| 3141 | 1796.278 |
| 3142 | 1797.721 |
| 3143 | 1789.419 |
| 3144 | 1787.367 |
| 3145 | 1779.026 |
| 3146 | 1781.463 |
| 3147 | 1784.839 |
| 3148 | 1781.942 |
| 3149 | 1781.782 |
| 3150 | 1799.423 |
| 3151 | 1809.087 |
| 3152 | 1811.824 |
| 3153 | 1801.858 |
| 3154 | 1817.084 |
| 3155 | 1817.667 |
| 3156 | 1820.846 |
| 3157 | 1815.534 |
| 3158 | 1816.03 |
| 3159 | 1821.663 |
| 3160 | 1818.853 |
| 3161 | 1825.913 |
| 3162 | 1825.753 |
| 3163 | 1824.9 |
| 3164 | 1821.909 |
| 3165 | 1808.218 |
| 3166 | 1805.195 |
| 3167 | 1805.155 |
| 3168 | 1801.872 |
| 3169 | 1819.994 |
| 3170 | 1827.133 |
| 3171 | 1834.383 |
| 3172 | 1834.383 |
| 3173 | 1834.223 |
| 3174 | 1839.066 |
| 3175 | 1835.444 |
| 3176 | 1840.5 |
| 3177 | 1843.576 |
| 3178 | 1852.696 |
| 3179 | 1845.389 |
| 3180 | 1844.693 |
| 3181 | 1839.895 |
| 3182 | 1834.016 |
| 3183 | 1830.33 |
| 3184 | 1829.895 |
| 3185 | 1838.431 |
| 3186 | 1837.901 |
| 3187 | 1842.09 |
| 3188 | 1842.128 |
| 3189 | 1850.396 |
| 3190 | 1852.509 |
| 3191 | 1846.314 |
| 3192 | 1842.171 |
| 3193 | 1846.186 |
| 3194 | 1847.794 |
| 3195 | 1842.294 |
| 3196 | 1844.131 |
| 3197 | 1845.503 |
| 3198 | 1848.768 |
| 3199 | 1848.608 |
| 3200 | 1846.706 |
| 3201 | 1855.747 |
| 3202 | 1854.996 |
| 3203 | 1851.673 |
| 3204 | 1848.611 |
| 3205 | 1844.096 |
| 3206 | 1851.788 |
| 3207 | 1842.169 |
| 3208 | 1830.799 |
| 3209 | 1849.875 |
| 3210 | 1841.661 |
| 3211 | 1857.456 |
| 3212 | 1862.559 |
| 3213 | 1857.303 |
| 3214 | 1860.348 |
| 3215 | 1868.45 |
| 3216 | 1875.274 |
| 3217 | 1867.091 |
| 3218 | 1869.149 |
| 3219 | 1869.589 |
| 3220 | 1872.074 |
| 3221 | 1872.317 |
| 3222 | 1877.997 |
| 3223 | 1877.837 |
| 3224 | 1876.55 |
| 3225 | 1872.675 |
| 3226 | 1874.275 |
| 3227 | 1885.612 |
| 3228 | 1874.746 |
| 3229 | 1881.902 |
| 3230 | 1887.352 |
| 3231 | 1892.543 |
| 3232 | 1889.031 |
| 3233 | 1888.871 |
| 3234 | 1893.572 |
| 3235 | 1893.412 |
| 3236 | 1887.73 |
| 3237 | 1889.11 |
| 3238 | 1890.134 |
| 3239 | 1887.609 |
| 3240 | 1894.18 |
| 3241 | 1896.782 |
| 3242 | 1899.78 |
| 3243 | 1906.114 |
| 3244 | 1906.208 |
| 3245 | 1907.737 |
| 3246 | 1915.224 |
| 3247 | 1922.324 |
| 3248 | 1925.116 |
| 3249 | 1922.613 |
| 3250 | 1924.151 |
| 3251 | 1923.511 |
| 3252 | 1905.228 |
| 3253 | 1912.391 |
| 3254 | 1916.698 |
| 3255 | 1916.538 |
| 3256 | 1906.32 |
| 3257 | 1901.955 |
| 3258 | 1899.721 |
| 3259 | 1898.016 |
| 3260 | 1893.825 |
| 3261 | 1886.068 |
| 3262 | 1887.487 |
| 3263 | 1898.88 |
| 3264 | 1897.009 |
| 3265 | 1896.849 |
| 3266 | 1898.205 |
| 3267 | 1898.045 |
| 3268 | 1901.349 |
| 3269 | 1897.017 |
| 3270 | 1893.441 |
| 3271 | 1894.703 |
| 3272 | 1894.543 |
| 3273 | 1901.398 |
| 3274 | 1901.398 |
| 3275 | 1901.791 |
| 3276 | 1900.283 |
| 3277 | 1899.067 |
| 3278 | 1897.614 |
| 3279 | 1895.601 |
| 3280 | 1900.902 |
| 3281 | 1902.282 |
| 3282 | 1927.884 |
| 3283 | 1923.314 |
| 3284 | 1920.599 |
| 3285 | 1924.835 |
| 3286 | 1935.193 |
| 3287 | 1941.725 |
| 3288 | 1945.772 |
| 3289 | 1946.299 |
| 3290 | 1941.256 |
| 3291 | 1939.867 |
| 3292 | 1932.985 |
| 3293 | 1935.833 |
| 3294 | 1940.51 |
| 3295 | 1943.72 |
| 3296 | 1940.074 |
| 3297 | 1943.868 |
| 3298 | 1944.356 |
| 3299 | 1945.412 |
| 3300 | 1941.569 |
| 3301 | 1942.475 |
| 3302 | 1936.47 |
| 3303 | 1939.814 |
| 3304 | 1933.209 |
| 3305 | 1930.557 |
| 3306 | 1918.713 |
| 3307 | 1918.159 |
| 3308 | 1913.487 |
| 3309 | 1913.487 |
| 3310 | 1915.056 |
| 3311 | 1913.998 |
| 3312 | 1917.879 |
| 3313 | 1920.229 |
| 3314 | 1921.467 |
| 3315 | 1919.88 |
| 3316 | 1918.561 |
| 3317 | 1912.272 |
| 3318 | 1907.671 |
| 3319 | 1905.942 |
| 3320 | 1907.716 |
| 3321 | 1911.257 |
| 3322 | 1911.097 |
| 3323 | 1906.544 |
| 3324 | 1904.049 |
| 3325 | 1903.889 |
| 3326 | 1912.007 |
| 3327 | 1915.943 |
| 3328 | 1919.855 |
| 3329 | 1927.642 |
| 3330 | 1927.861 |
| 3331 | 1930.464 |
| 3332 | 1924.916 |
| 3333 | 1931.172 |
| 3334 | 1931.968 |
| 3335 | 1930.562 |
| 3336 | 1928.833 |
| 3337 | 1930.536 |
| 3338 | 1924.058 |
| 3339 | 1924.782 |
| 3340 | 1924.268 |
| 3341 | 1924.536 |
| 3342 | 1917.544 |
| 3343 | 1920.864 |
| 3344 | 1920.272 |
| 3345 | 1920.334 |
| 3346 | 1920.174 |
| 3347 | 1923.96 |
| 3348 | 1921.931 |
| 3349 | 1921.685 |
| 3350 | 1920.722 |
| 3351 | 1934.67 |
| 3352 | 1932.207 |
| 3353 | 1929.468 |
| 3354 | 1930.004 |
| 3355 | 1939.092 |
| 3356 | 1931.595 |
| 3357 | 1935.31 |
| 3358 | 1933.928 |
| 3359 | 1931.9 |
| 3360 | 1928.94 |
| 3361 | 1928.426 |
| 3362 | 1927.391 |
| 3363 | 1930.033 |
| 3364 | 1937.378 |
| 3365 | 1933.645 |
| 3366 | 1936.878 |
| 3367 | 1937.714 |
| 3368 | 1936.734 |
| 3369 | 1936.22 |
| 3370 | 1937.418 |
| 3371 | 1935.634 |
| 3372 | 1936.99 |
| 3373 | 1936.492 |
| 3374 | 1934.566 |
| 3375 | 1925.752 |
| 3376 | 1926.113 |
| 3377 | 1927.201 |
| 3378 | 1928.076 |
| 3379 | 1931.554 |
| 3380 | 1936.295 |
| 3381 | 1936.933 |
| 3382 | 1931.811 |
| 3383 | 1927.731 |
| 3384 | 1925.387 |
| 3385 | 1923.279 |
| 3386 | 1923.119 |
| 3387 | 1915.125 |
| 3388 | 1920.907 |
| 3389 | 1923.77 |
| 3390 | 1922.862 |
| 3391 | 1916.549 |
| 3392 | 1916.682 |
| 3393 | 1915.781 |
| 3394 | 1914.778 |
| 3395 | 1918.975 |
| 3396 | 1922.792 |
| 3397 | 1922.792 |
| 3398 | 1921.994 |
| 3399 | 1921.323 |
| 3400 | 1913.621 |
| 3401 | 1914.598 |
| 3402 | 1916.088 |
| 3403 | 1916.915 |
| 3404 | 1910.555 |
| 3405 | 1909.378 |
| 3406 | 1906.237 |
| 3407 | 1912.611 |
| 3408 | 1910.645 |
| 3409 | 1910.952 |
| 3410 | 1915.322 |
| 3411 | 1918.185 |
| 3412 | 1935.124 |
| 3413 | 1935.051 |
| 3414 | 1935.279 |
| 3415 | 1938.197 |
| 3416 | 1931.845 |
| 3417 | 1936.87 |
| 3418 | 1940.111 |
| 3419 | 1933.475 |
| 3420 | 1933.475 |
| 3421 | 1933.315 |
| 3422 | 1937.109 |
| 3423 | 1936.949 |
| 3424 | 1931.504 |
| 3425 | 1935.684 |
| 3426 | 1935.524 |
| 3427 | 1958.183 |
| 3428 | 1956.801 |
| 3429 | 1959.846 |
| 3430 | 1959.686 |
| 3431 | 1960.986 |
| 3432 | 1963.305 |
| 3433 | 1965.355 |
| 3434 | 1959.066 |
| 3435 | 1960.88 |
| 3436 | 1957.809 |
| 3437 | 1956.885 |
| 3438 | 1957.657 |
| 3439 | 1957.861 |
| 3440 | 1960.069 |
| 3441 | 1962.238 |
| 3442 | 1955.309 |
| 3443 | 1957.557 |
| 3444 | 1961.832 |
| 3445 | 1962.241 |
| 3446 | 1963.021 |
| 3447 | 1959.083 |
| 3448 | 1960.849 |
| 3449 | 1960.689 |
| 3450 | 1966.267 |
| 3451 | 1967.575 |
| 3452 | 1975.212 |
| 3453 | 1974.224 |
| 3454 | 1978.91 |
| 3455 | 1984.542 |
| 3456 | 1986.182 |
| 3457 | 1982.796 |
| 3458 | 1983.505 |
| 3459 | 1985.666 |
| 3460 | 1985.506 |
| 3461 | 1988.464 |
| 3462 | 1990.348 |
| 3463 | 1991.547 |
| 3464 | 1999.001 |
| 3465 | 1998.077 |
| 3466 | 2003.094 |
| 3467 | 2005.476 |
| 3468 | 2006.28 |
| 3469 | 2005.032 |
| 3470 | 2001.67 |
| 3471 | 2003.223 |
| 3472 | 1996.492 |
| 3473 | 1995.362 |
| 3474 | 1991.692 |
| 3475 | 1992.772 |
| 3476 | 1995.785 |
| 3477 | 1999.042 |
| 3478 | 1998.244 |
| 3479 | 2006.709 |
| 3480 | 2005.383 |
| 3481 | 2006.936 |
| 3482 | 2004.655 |
| 3483 | 2004.614 |
| 3484 | 2003.248 |
| 3485 | 2005.559 |
| 3486 | 2005.881 |
| 3487 | 1998.566 |
| 3488 | 1996.624 |
| 3489 | 1994.705 |
| 3490 | 1997.529 |
| 3491 | 1995.792 |
| 3492 | 1996.951 |
| 3493 | 1998.749 |
| 3494 | 1995.623 |
| 3495 | 1995.756 |
| 3496 | 1996.047 |
| 3497 | 1997.379 |
| 3498 | 1997.219 |
| 3499 | 1996.532 |
| 3500 | 1996.625 |
| 3501 | 1992.229 |
| 3502 | 1988.291 |
| 3503 | 1991.683 |
| 3504 | 1998.246 |
| 3505 | 2001.882 |
| 3506 | 2005.653 |
| 3507 | 2012.161 |
| 3508 | 2009.674 |
| 3509 | 2010.983 |
| 3510 | 2010.359 |
| 3511 | 2006.776 |
| 3512 | 2002.987 |
| 3513 | 2002.987 |
| 3514 | 2003.436 |
| 3515 | 2003.276 |
| 3516 | 2004.174 |
| 3517 | 2010.959 |
| 3518 | 2010.121 |
| 3519 | 2015.943 |
| 3520 | 2012.549 |
| 3521 | 2011.885 |
| 3522 | 2014.456 |
| 3523 | 2014.296 |
| 3524 | 2015.36 |
| 3525 | 2006.112 |
| 3526 | 2007.452 |
| 3527 | 2004.295 |
| 3528 | 1996.593 |
| 3529 | 1997.744 |
| 3530 | 1995.297 |
| 3531 | 1990.152 |
| 3532 | 1986.9 |
| 3533 | 1989.582 |
| 3534 | 1989.596 |
| 3535 | 1983.764 |
| 3536 | 1983.613 |
| 3537 | 1983.453 |
| 3538 | 1983.2 |
| 3539 | 1980.264 |
| 3540 | 1984.989 |
| 3541 | 1990.653 |
| 3542 | 1990.809 |
| 3543 | 2001.562 |
| 3544 | 1997.948 |
| 3545 | 2000.716 |
| 3546 | 2000.556 |
| 3547 | 2004.847 |
| 3548 | 2012.894 |
| 3549 | 2013.563 |
| 3550 | 2006.295 |
| 3551 | 2015.715 |
| 3552 | 2012.858 |
| 3553 | 2012.698 |
| 3554 | 2011.474 |
| 3555 | 2014.187 |
| 3556 | 2013.152 |
| 3557 | 2014.453 |
| 3558 | 2015.122 |
| 3559 | 2015.413 |
| 3560 | 2011.925 |
| 3561 | 2018.03 |
| 3562 | 2015.725 |
| 3563 | 2015.565 |
| 3564 | 2011.69 |
| 3565 | 2018.222 |
| 3566 | 2008.919 |
| 3567 | 2002.819 |
| 3568 | 1999.378 |
| 3569 | 1999.218 |
| 3570 | 2001.299 |
| 3571 | 2003.579 |
| 3572 | 2005.858 |
| 3573 | 2005.359 |
| 3574 | 2014.345 |
| 3575 | 2020.837 |
| 3576 | 2018.067 |
| 3577 | 2020.827 |
| 3578 | 2025.537 |
| 3579 | 2028.021 |
| 3580 | 2029.211 |
| 3581 | 2024.058 |
| 3582 | 2022.936 |
| 3583 | 2020.766 |
| 3584 | 2028.781 |
| 3585 | 2030.997 |
| 3586 | 2030.065 |
| 3587 | 2031.902 |
| 3588 | 2028.65 |
| 3589 | 2023.268 |
| 3590 | 2021.997 |
| 3591 | 2018.484 |
| 3592 | 2017.237 |
| 3593 | 2014.742 |
| 3594 | 2013.076 |
| 3595 | 2014.772 |
| 3596 | 2008.893 |
| 3597 | 2003.929 |
| 3598 | 2003.588 |
| 3599 | 1997.654 |
| 3600 | 1995.941 |
| 3601 | 1993.912 |
| 3602 | 1995.583 |
| 3603 | 1997.255 |
| 3604 | 1997.996 |
| 3605 | 1995.62 |
| 3606 | 1992.328 |
| 3607 | 2001.306 |
| 3608 | 1998.938 |
| 3609 | 1997.738 |
| 3610 | 1995.661 |
| 3611 | 1998.485 |
| 3612 | 1990.815 |
| 3613 | 1989.07 |
| 3614 | 1985.076 |
| 3615 | 1995.261 |
| 3616 | 1997.722 |
| 3617 | 1995.512 |
| 3618 | 1996.023 |
| 3619 | 2001.522 |
| 3620 | 2002.459 |
| 3621 | 2001.338 |
| 3622 | 2002.355 |
| 3623 | 2004.547 |
| 3624 | 2008.53 |
| 3625 | 2012.072 |
| 3626 | 2012.072 |
| 3627 | 2013.688 |
| 3628 | 2014.374 |
| 3629 | 2014.617 |
| 3630 | 2013.732 |
| 3631 | 2012.177 |
| 3632 | 2007.765 |
| 3633 | 2008.403 |
| 3634 | 2009.018 |
| 3635 | 2013.743 |
| 3636 | 2009.56 |
| 3637 | 2009.275 |
| 3638 | 2011.522 |
| 3639 | 2004.515 |
| 3640 | 2002.896 |
| 3641 | 2003.392 |
| 3642 | 2003.888 |
| 3643 | 1999.926 |
| 3644 | 2004.47 |
| 3645 | 2006.047 |
| 3646 | 2003.45 |
| 3647 | 2005.303 |
| 3648 | 2004.3 |
| 3649 | 2006.65 |
| 3650 | 2003.114 |
| 3651 | 2003.114 |
| 3652 | 2002.19 |
| 3653 | 1994.591 |
| 3654 | 1998.511 |
| 3655 | 1998.511 |
| 3656 | 1997.957 |
| 3657 | 2003.385 |
| 3658 | 1999.667 |
| 3659 | 2008.093 |
| 3660 | 2014.009 |
| 3661 | 2018.316 |
| 3662 | 2010.038 |
| 3663 | 2006.368 |
| 3664 | 2001.98 |
| 3665 | 2001.98 |
| 3666 | 2001.269 |
| 3667 | 1998.806 |
| 3668 | 1998.119 |
| 3669 | 1999.877 |
| 3670 | 2004.35 |
| 3671 | 2004.19 |
| 3672 | 2009.641 |
| 3673 | 2010.839 |
| 3674 | 2012.558 |
| 3675 | 2010.766 |
| 3676 | 2007.293 |
| 3677 | 2005.777 |
| 3678 | 2005.444 |
| 3679 | 2005.948 |
| 3680 | 2006.373 |
| 3681 | 2000.589 |
| 3682 | 1996.422 |
| 3683 | 2000.839 |
| 3684 | 2000.839 |
| 3685 | 2003.481 |
| 3686 | 2004.703 |
| 3687 | 2007.834 |
| 3688 | 2008.922 |
| 3689 | 2021.174 |
| 3690 | 2024.179 |
| 3691 | 2024.019 |
| 3692 | 2025.115 |
| 3693 | 2020.821 |
| 3694 | 2022.406 |
| 3695 | 2023.115 |
| 3696 | 2028.692 |
| 3697 | 2030.388 |
| 3698 | 2030.505 |
| 3699 | 2035.806 |
| 3700 | 2040.128 |
| 3701 | 2041.169 |
| 3702 | 2046.706 |
| 3703 | 2045.995 |
| 3704 | 2051.872 |
| 3705 | 2054.909 |
| 3706 | 2063.981 |
| 3707 | 2066.552 |
| 3708 | 2064.721 |
| 3709 | 2065.114 |
| 3710 | 2071.883 |
| 3711 | 2076.355 |
| 3712 | 2070.547 |
| 3713 | 2062.908 |
| 3714 | 2065.984 |
| 3715 | 2065.984 |
| 3716 | 2066.969 |
| 3717 | 2059.331 |
| 3718 | 2057.539 |
| 3719 | 2053.963 |
| 3720 | 2054.491 |
| 3721 | 2055.445 |
| 3722 | 2059.183 |
| 3723 | 2059.023 |
| 3724 | 2055.456 |
| 3725 | 2057.909 |
| 3726 | 2054.365 |
| 3727 | 2057.165 |
| 3728 | 2057.005 |
| 3729 | 2061.146 |
| 3730 | 2064.656 |
| 3731 | 2065.168 |
| 3732 | 2074.784 |
| 3733 | 2077.49 |
| 3734 | 2077.954 |
| 3735 | 2070.891 |
| 3736 | 2068.76 |
| 3737 | 2064.79 |
| 3738 | 2065.894 |
| 3739 | 2065.734 |
| 3740 | 2065.89 |
| 3741 | 2074.19 |
| 3742 | 2073.076 |
| 3743 | 2068.136 |
| 3744 | 2066.935 |
| 3745 | 2060.464 |
| 3746 | 2057.718 |
| 3747 | 2059.713 |
| 3748 | 2062.307 |
| 3749 | 2065.541 |
| 3750 | 2073.47 |
| 3751 | 2069.563 |
| 3752 | 2069.033 |
| 3753 | 2065.237 |
| 3754 | 2069.504 |
| 3755 | 2065.621 |
| 3756 | 2068.768 |
| 3757 | 2066.519 |
| 3758 | 2070.873 |
| 3759 | 2070.873 |
| 3760 | 2072.024 |
| 3761 | 2068.117 |
| 3762 | 2069.505 |
| 3763 | 2069.345 |
| 3764 | 2074.575 |
| 3765 | 2070.502 |
| 3766 | 2072.576 |
| 3767 | 2071.699 |
| 3768 | 2070.428 |
| 3769 | 2067.981 |
| 3770 | 2069.558 |
| 3771 | 2074.575 |
| 3772 | 2080.026 |
| 3773 | 2081.176 |
| 3774 | 2082.067 |
| 3775 | 2086.09 |
| 3776 | 2098.815 |
| 3777 | 2102.065 |
| 3778 | 2105.441 |
| 3779 | 2105.747 |
| 3780 | 2103.537 |
| 3781 | 2106.621 |
| 3782 | 2110.628 |
| 3783 | 2110.059 |
| 3784 | 2108.132 |
| 3785 | 2108.715 |
| 3786 | 2112.343 |
| 3787 | 2110.465 |
| 3788 | 2110.305 |
| 3789 | 2120.553 |
| 3790 | 2119.936 |
| 3791 | 2118.215 |
| 3792 | 2119.595 |
| 3793 | 2115.341 |
| 3794 | 2114.827 |
| 3795 | 2121.351 |
| 3796 | 2119.085 |
| 3797 | 2125.278 |
| 3798 | 2127.352 |
| 3799 | 2122.617 |
| 3800 | 2121.858 |
| 3801 | 2126.26 |
| 3802 | 2126.921 |
| 3803 | 2127.22 |
| 3804 | 2124.016 |
| 3805 | 2121.529 |
| 3806 | 2119.674 |
| 3807 | 2119.539 |
| 3808 | 2119.727 |
| 3809 | 2117.501 |
| 3810 | 2124.08 |
| 3811 | 2120.205 |
| 3812 | 2117.853 |
| 3813 | 2120.708 |
| 3814 | 2116.083 |
| 3815 | 2113.486 |
| 3816 | 2113.161 |
| 3817 | 2112.119 |
| 3818 | 2114.524 |
| 3819 | 2113.419 |
| 3820 | 2115.65 |
| 3821 | 2115.49 |
| 3822 | 2110.968 |
| 3823 | 2107.093 |
| 3824 | 2110.485 |
| 3825 | 2106.16 |
| 3826 | 2109.039 |
| 3827 | 2113.685 |
| 3828 | 2115.995 |
| 3829 | 2116.768 |
| 3830 | 2123.386 |
| 3831 | 2110.098 |
| 3832 | 2115.549 |
| 3833 | 2115.389 |
| 3834 | 2109.439 |
| 3835 | 2105.169 |
| 3836 | 2103.283 |
| 3837 | 2102.508 |
| 3838 | 2105.348 |
| 3839 | 2113.884 |
| 3840 | 2114.932 |
| 3841 | 2117.653 |
| 3842 | 2114.346 |
| 3843 | 2115.883 |
| 3844 | 2116.687 |
| 3845 | 2124.063 |
| 3846 | 2128.054 |
| 3847 | 2133.174 |
| 3848 | 2132.265 |
| 3849 | 2123.191 |
| 3850 | 2124.373 |
| 3851 | 2124.64 |
| 3852 | 2127.961 |
| 3853 | 2127.801 |
| 3854 | 2119.933 |
| 3855 | 2115.419 |
| 3856 | 2123.348 |
| 3857 | 2122.873 |
| 3858 | 2117.341 |
| 3859 | 2112.945 |
| 3860 | 2116.629 |
| 3861 | 2119.421 |
| 3862 | 2121.392 |
| 3863 | 2114.345 |
| 3864 | 2117.35 |
| 3865 | 2123.069 |
| 3866 | 2118.823 |
| 3867 | 2117.891 |
| 3868 | 2123.192 |
| 3869 | 2122.536 |
| 3870 | 2114.535 |
| 3871 | 2114.944 |
| 3872 | 2116.797 |
| 3873 | 2116.637 |
| 3874 | 2118.293 |
| 3875 | 2113.258 |
| 3876 | 2113.258 |
| 3877 | 2117.367 |
| 3878 | 2124.665 |
| 3879 | 2116.963 |
| 3880 | 2118.918 |